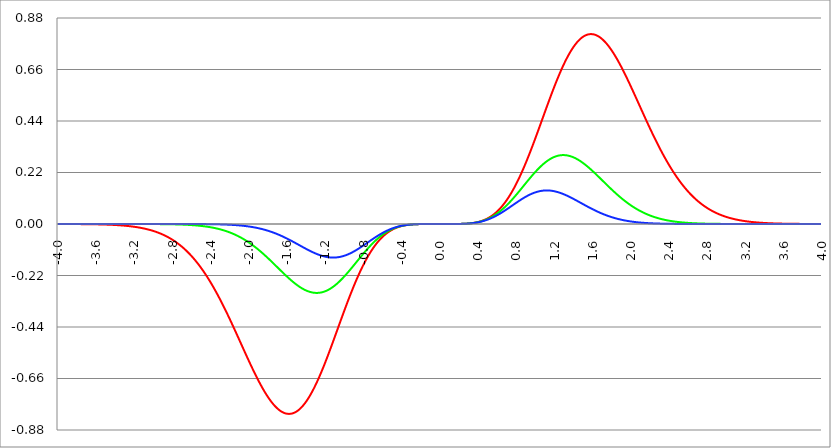
| Category | Series 1 | Series 0 | Series 2 |
|---|---|---|---|
| -4.0 | 0 | 0 | 0 |
| -3.996 | 0 | 0 | 0 |
| -3.992 | 0 | 0 | 0 |
| -3.988 | 0 | 0 | 0 |
| -3.984 | 0 | 0 | 0 |
| -3.98 | 0 | 0 | 0 |
| -3.976 | 0 | 0 | 0 |
| -3.972 | 0 | 0 | 0 |
| -3.968 | 0 | 0 | 0 |
| -3.964 | 0 | 0 | 0 |
| -3.96 | 0 | 0 | 0 |
| -3.956 | 0 | 0 | 0 |
| -3.952 | 0 | 0 | 0 |
| -3.948 | 0 | 0 | 0 |
| -3.944 | 0 | 0 | 0 |
| -3.94 | 0 | 0 | 0 |
| -3.936 | 0 | 0 | 0 |
| -3.932 | 0 | 0 | 0 |
| -3.928 | 0 | 0 | 0 |
| -3.924 | 0 | 0 | 0 |
| -3.92 | 0 | 0 | 0 |
| -3.916 | 0 | 0 | 0 |
| -3.912 | 0 | 0 | 0 |
| -3.908 | 0 | 0 | 0 |
| -3.904 | 0 | 0 | 0 |
| -3.9 | 0 | 0 | 0 |
| -3.896 | 0 | 0 | 0 |
| -3.892 | 0 | 0 | 0 |
| -3.888 | 0 | 0 | 0 |
| -3.884 | 0 | 0 | 0 |
| -3.88 | 0 | 0 | 0 |
| -3.876 | 0 | 0 | 0 |
| -3.872 | 0 | 0 | 0 |
| -3.868 | 0 | 0 | 0 |
| -3.864 | 0 | 0 | 0 |
| -3.86 | 0 | 0 | 0 |
| -3.856 | 0 | 0 | 0 |
| -3.852 | 0 | 0 | 0 |
| -3.848 | 0 | 0 | 0 |
| -3.844 | 0 | 0 | 0 |
| -3.84 | 0 | 0 | 0 |
| -3.836 | 0 | 0 | 0 |
| -3.832 | 0 | 0 | 0 |
| -3.828 | 0 | 0 | 0 |
| -3.824 | 0 | 0 | 0 |
| -3.82 | 0 | 0 | 0 |
| -3.816 | 0 | 0 | 0 |
| -3.812 | 0 | 0 | 0 |
| -3.808 | 0 | 0 | 0 |
| -3.804 | 0 | 0 | 0 |
| -3.8 | 0 | 0 | 0 |
| -3.796 | 0 | 0 | 0 |
| -3.792 | 0 | 0 | 0 |
| -3.788 | 0 | 0 | 0 |
| -3.784 | 0 | 0 | 0 |
| -3.78 | 0 | 0 | 0 |
| -3.776 | 0 | 0 | 0 |
| -3.772 | -0.001 | 0 | 0 |
| -3.768 | -0.001 | 0 | 0 |
| -3.764 | -0.001 | 0 | 0 |
| -3.76 | -0.001 | 0 | 0 |
| -3.756 | -0.001 | 0 | 0 |
| -3.752 | -0.001 | 0 | 0 |
| -3.748 | -0.001 | 0 | 0 |
| -3.744 | -0.001 | 0 | 0 |
| -3.74 | -0.001 | 0 | 0 |
| -3.736 | -0.001 | 0 | 0 |
| -3.732 | -0.001 | 0 | 0 |
| -3.728 | -0.001 | 0 | 0 |
| -3.724 | -0.001 | 0 | 0 |
| -3.72 | -0.001 | 0 | 0 |
| -3.716 | -0.001 | 0 | 0 |
| -3.712 | -0.001 | 0 | 0 |
| -3.708 | -0.001 | 0 | 0 |
| -3.704 | -0.001 | 0 | 0 |
| -3.7 | -0.001 | 0 | 0 |
| -3.696 | -0.001 | 0 | 0 |
| -3.692 | -0.001 | 0 | 0 |
| -3.688 | -0.001 | 0 | 0 |
| -3.684 | -0.001 | 0 | 0 |
| -3.68 | -0.001 | 0 | 0 |
| -3.676 | -0.001 | 0 | 0 |
| -3.672 | -0.001 | 0 | 0 |
| -3.668 | -0.001 | 0 | 0 |
| -3.664 | -0.001 | 0 | 0 |
| -3.66 | -0.001 | 0 | 0 |
| -3.656 | -0.001 | 0 | 0 |
| -3.652 | -0.001 | 0 | 0 |
| -3.648 | -0.001 | 0 | 0 |
| -3.644 | -0.001 | 0 | 0 |
| -3.64 | -0.001 | 0 | 0 |
| -3.636 | -0.001 | 0 | 0 |
| -3.632 | -0.001 | 0 | 0 |
| -3.628 | -0.001 | 0 | 0 |
| -3.624 | -0.001 | 0 | 0 |
| -3.62 | -0.001 | 0 | 0 |
| -3.616 | -0.001 | 0 | 0 |
| -3.612 | -0.001 | 0 | 0 |
| -3.608 | -0.001 | 0 | 0 |
| -3.604 | -0.001 | 0 | 0 |
| -3.6 | -0.001 | 0 | 0 |
| -3.596 | -0.001 | 0 | 0 |
| -3.592 | -0.001 | 0 | 0 |
| -3.588 | -0.002 | 0 | 0 |
| -3.584 | -0.002 | 0 | 0 |
| -3.58 | -0.002 | 0 | 0 |
| -3.576 | -0.002 | 0 | 0 |
| -3.572 | -0.002 | 0 | 0 |
| -3.568 | -0.002 | 0 | 0 |
| -3.564 | -0.002 | 0 | 0 |
| -3.56 | -0.002 | 0 | 0 |
| -3.556 | -0.002 | 0 | 0 |
| -3.552 | -0.002 | 0 | 0 |
| -3.548 | -0.002 | 0 | 0 |
| -3.544 | -0.002 | 0 | 0 |
| -3.54 | -0.002 | 0 | 0 |
| -3.536 | -0.002 | 0 | 0 |
| -3.532 | -0.002 | 0 | 0 |
| -3.528 | -0.002 | 0 | 0 |
| -3.524 | -0.002 | 0 | 0 |
| -3.52 | -0.002 | 0 | 0 |
| -3.516 | -0.002 | 0 | 0 |
| -3.512 | -0.002 | 0 | 0 |
| -3.508 | -0.002 | 0 | 0 |
| -3.504 | -0.002 | 0 | 0 |
| -3.5 | -0.003 | 0 | 0 |
| -3.496 | -0.003 | 0 | 0 |
| -3.492 | -0.003 | 0 | 0 |
| -3.488 | -0.003 | 0 | 0 |
| -3.484 | -0.003 | 0 | 0 |
| -3.48 | -0.003 | 0 | 0 |
| -3.476 | -0.003 | 0 | 0 |
| -3.472 | -0.003 | 0 | 0 |
| -3.467999999999999 | -0.003 | 0 | 0 |
| -3.463999999999999 | -0.003 | 0 | 0 |
| -3.459999999999999 | -0.003 | 0 | 0 |
| -3.455999999999999 | -0.003 | 0 | 0 |
| -3.451999999999999 | -0.003 | 0 | 0 |
| -3.447999999999999 | -0.003 | 0 | 0 |
| -3.443999999999999 | -0.003 | 0 | 0 |
| -3.439999999999999 | -0.003 | 0 | 0 |
| -3.435999999999999 | -0.004 | 0 | 0 |
| -3.431999999999999 | -0.004 | 0 | 0 |
| -3.427999999999999 | -0.004 | 0 | 0 |
| -3.423999999999999 | -0.004 | 0 | 0 |
| -3.419999999999999 | -0.004 | 0 | 0 |
| -3.415999999999999 | -0.004 | 0 | 0 |
| -3.411999999999999 | -0.004 | 0 | 0 |
| -3.407999999999999 | -0.004 | 0 | 0 |
| -3.403999999999999 | -0.004 | 0 | 0 |
| -3.399999999999999 | -0.004 | 0 | 0 |
| -3.395999999999999 | -0.004 | 0 | 0 |
| -3.391999999999999 | -0.005 | 0 | 0 |
| -3.387999999999999 | -0.005 | 0 | 0 |
| -3.383999999999999 | -0.005 | 0 | 0 |
| -3.379999999999999 | -0.005 | 0 | 0 |
| -3.375999999999999 | -0.005 | 0 | 0 |
| -3.371999999999999 | -0.005 | 0 | 0 |
| -3.367999999999999 | -0.005 | 0 | 0 |
| -3.363999999999999 | -0.005 | 0 | 0 |
| -3.359999999999999 | -0.005 | 0 | 0 |
| -3.355999999999999 | -0.005 | 0 | 0 |
| -3.351999999999999 | -0.006 | 0 | 0 |
| -3.347999999999999 | -0.006 | 0 | 0 |
| -3.343999999999999 | -0.006 | 0 | 0 |
| -3.339999999999999 | -0.006 | 0 | 0 |
| -3.335999999999999 | -0.006 | 0 | 0 |
| -3.331999999999999 | -0.006 | 0 | 0 |
| -3.327999999999999 | -0.006 | 0 | 0 |
| -3.323999999999999 | -0.006 | 0 | 0 |
| -3.319999999999999 | -0.007 | 0 | 0 |
| -3.315999999999999 | -0.007 | 0 | 0 |
| -3.311999999999999 | -0.007 | 0 | 0 |
| -3.307999999999999 | -0.007 | 0 | 0 |
| -3.303999999999999 | -0.007 | 0 | 0 |
| -3.299999999999999 | -0.007 | 0 | 0 |
| -3.295999999999999 | -0.007 | 0 | 0 |
| -3.291999999999999 | -0.008 | 0 | 0 |
| -3.288 | -0.008 | 0 | 0 |
| -3.284 | -0.008 | 0 | 0 |
| -3.279999999999999 | -0.008 | 0 | 0 |
| -3.275999999999999 | -0.008 | 0 | 0 |
| -3.271999999999999 | -0.008 | 0 | 0 |
| -3.268 | -0.009 | 0 | 0 |
| -3.264 | -0.009 | 0 | 0 |
| -3.259999999999999 | -0.009 | 0 | 0 |
| -3.255999999999999 | -0.009 | 0 | 0 |
| -3.251999999999999 | -0.009 | 0 | 0 |
| -3.248 | -0.009 | 0 | 0 |
| -3.244 | -0.01 | 0 | 0 |
| -3.239999999999999 | -0.01 | 0 | 0 |
| -3.235999999999999 | -0.01 | 0 | 0 |
| -3.231999999999999 | -0.01 | 0 | 0 |
| -3.228 | -0.01 | 0 | 0 |
| -3.224 | -0.011 | 0 | 0 |
| -3.219999999999999 | -0.011 | 0 | 0 |
| -3.215999999999999 | -0.011 | 0 | 0 |
| -3.211999999999999 | -0.011 | 0 | 0 |
| -3.208 | -0.012 | 0 | 0 |
| -3.204 | -0.012 | 0 | 0 |
| -3.199999999999999 | -0.012 | 0 | 0 |
| -3.195999999999999 | -0.012 | 0 | 0 |
| -3.191999999999999 | -0.012 | 0 | 0 |
| -3.188 | -0.013 | 0 | 0 |
| -3.184 | -0.013 | 0 | 0 |
| -3.179999999999999 | -0.013 | 0 | 0 |
| -3.175999999999999 | -0.013 | 0 | 0 |
| -3.171999999999999 | -0.014 | 0 | 0 |
| -3.168 | -0.014 | 0 | 0 |
| -3.164 | -0.014 | 0 | 0 |
| -3.159999999999999 | -0.015 | 0 | 0 |
| -3.155999999999999 | -0.015 | 0 | 0 |
| -3.151999999999999 | -0.015 | 0 | 0 |
| -3.148 | -0.015 | 0 | 0 |
| -3.144 | -0.016 | 0 | 0 |
| -3.139999999999999 | -0.016 | 0 | 0 |
| -3.135999999999999 | -0.016 | 0 | 0 |
| -3.131999999999999 | -0.017 | 0 | 0 |
| -3.128 | -0.017 | 0 | 0 |
| -3.124 | -0.017 | 0 | 0 |
| -3.119999999999999 | -0.018 | 0 | 0 |
| -3.115999999999999 | -0.018 | 0 | 0 |
| -3.111999999999999 | -0.018 | 0 | 0 |
| -3.108 | -0.019 | 0 | 0 |
| -3.104 | -0.019 | 0 | 0 |
| -3.099999999999999 | -0.019 | 0 | 0 |
| -3.095999999999999 | -0.02 | 0 | 0 |
| -3.091999999999999 | -0.02 | 0 | 0 |
| -3.088 | -0.02 | 0 | 0 |
| -3.084 | -0.021 | 0 | 0 |
| -3.079999999999999 | -0.021 | 0 | 0 |
| -3.075999999999999 | -0.021 | 0 | 0 |
| -3.071999999999999 | -0.022 | 0 | 0 |
| -3.068 | -0.022 | 0 | 0 |
| -3.064 | -0.023 | 0 | 0 |
| -3.059999999999999 | -0.023 | 0 | 0 |
| -3.055999999999999 | -0.023 | 0 | 0 |
| -3.051999999999999 | -0.024 | 0 | 0 |
| -3.048 | -0.024 | 0 | 0 |
| -3.044 | -0.025 | 0 | 0 |
| -3.039999999999999 | -0.025 | 0 | 0 |
| -3.035999999999999 | -0.026 | 0 | 0 |
| -3.031999999999999 | -0.026 | 0 | 0 |
| -3.028 | -0.027 | 0 | 0 |
| -3.024 | -0.027 | 0 | 0 |
| -3.019999999999999 | -0.027 | 0 | 0 |
| -3.015999999999999 | -0.028 | 0 | 0 |
| -3.011999999999999 | -0.028 | 0 | 0 |
| -3.008 | -0.029 | 0 | 0 |
| -3.004 | -0.029 | 0 | 0 |
| -2.999999999999999 | -0.03 | 0 | 0 |
| -2.995999999999999 | -0.031 | 0 | 0 |
| -2.991999999999999 | -0.031 | 0 | 0 |
| -2.988 | -0.032 | 0 | 0 |
| -2.984 | -0.032 | 0 | 0 |
| -2.979999999999999 | -0.033 | 0 | 0 |
| -2.975999999999999 | -0.033 | 0 | 0 |
| -2.971999999999999 | -0.034 | 0 | 0 |
| -2.968 | -0.034 | 0 | 0 |
| -2.964 | -0.035 | 0 | 0 |
| -2.959999999999999 | -0.036 | 0 | 0 |
| -2.955999999999999 | -0.036 | 0 | 0 |
| -2.951999999999999 | -0.037 | 0 | 0 |
| -2.948 | -0.037 | 0 | 0 |
| -2.944 | -0.038 | 0 | 0 |
| -2.939999999999999 | -0.039 | -0.001 | 0 |
| -2.935999999999999 | -0.039 | -0.001 | 0 |
| -2.931999999999999 | -0.04 | -0.001 | 0 |
| -2.928 | -0.041 | -0.001 | 0 |
| -2.924 | -0.041 | -0.001 | 0 |
| -2.919999999999999 | -0.042 | -0.001 | 0 |
| -2.915999999999999 | -0.043 | -0.001 | 0 |
| -2.911999999999999 | -0.043 | -0.001 | 0 |
| -2.908 | -0.044 | -0.001 | 0 |
| -2.904 | -0.045 | -0.001 | 0 |
| -2.899999999999999 | -0.046 | -0.001 | 0 |
| -2.895999999999999 | -0.046 | -0.001 | 0 |
| -2.891999999999999 | -0.047 | -0.001 | 0 |
| -2.887999999999999 | -0.048 | -0.001 | 0 |
| -2.883999999999999 | -0.049 | -0.001 | 0 |
| -2.879999999999999 | -0.05 | -0.001 | 0 |
| -2.875999999999999 | -0.05 | -0.001 | 0 |
| -2.871999999999999 | -0.051 | -0.001 | 0 |
| -2.867999999999999 | -0.052 | -0.001 | 0 |
| -2.863999999999999 | -0.053 | -0.001 | 0 |
| -2.859999999999999 | -0.054 | -0.001 | 0 |
| -2.855999999999999 | -0.054 | -0.001 | 0 |
| -2.851999999999999 | -0.055 | -0.001 | 0 |
| -2.847999999999999 | -0.056 | -0.001 | 0 |
| -2.843999999999999 | -0.057 | -0.001 | 0 |
| -2.839999999999999 | -0.058 | -0.001 | 0 |
| -2.835999999999999 | -0.059 | -0.001 | 0 |
| -2.831999999999999 | -0.06 | -0.001 | 0 |
| -2.827999999999999 | -0.061 | -0.001 | 0 |
| -2.823999999999999 | -0.062 | -0.001 | 0 |
| -2.819999999999999 | -0.063 | -0.001 | 0 |
| -2.815999999999999 | -0.064 | -0.001 | 0 |
| -2.811999999999999 | -0.065 | -0.001 | 0 |
| -2.807999999999999 | -0.066 | -0.001 | 0 |
| -2.803999999999999 | -0.067 | -0.001 | 0 |
| -2.799999999999999 | -0.068 | -0.001 | 0 |
| -2.795999999999999 | -0.069 | -0.001 | 0 |
| -2.791999999999999 | -0.07 | -0.001 | 0 |
| -2.787999999999999 | -0.071 | -0.001 | 0 |
| -2.783999999999999 | -0.072 | -0.001 | 0 |
| -2.779999999999999 | -0.073 | -0.002 | 0 |
| -2.775999999999999 | -0.074 | -0.002 | 0 |
| -2.771999999999999 | -0.075 | -0.002 | 0 |
| -2.767999999999999 | -0.076 | -0.002 | 0 |
| -2.763999999999999 | -0.078 | -0.002 | 0 |
| -2.759999999999999 | -0.079 | -0.002 | 0 |
| -2.755999999999999 | -0.08 | -0.002 | 0 |
| -2.751999999999999 | -0.081 | -0.002 | 0 |
| -2.747999999999999 | -0.082 | -0.002 | 0 |
| -2.743999999999999 | -0.084 | -0.002 | 0 |
| -2.739999999999999 | -0.085 | -0.002 | 0 |
| -2.735999999999999 | -0.086 | -0.002 | 0 |
| -2.731999999999999 | -0.087 | -0.002 | 0 |
| -2.727999999999999 | -0.089 | -0.002 | 0 |
| -2.723999999999999 | -0.09 | -0.002 | 0 |
| -2.719999999999999 | -0.091 | -0.002 | 0 |
| -2.715999999999999 | -0.092 | -0.002 | 0 |
| -2.711999999999999 | -0.094 | -0.002 | 0 |
| -2.707999999999999 | -0.095 | -0.002 | 0 |
| -2.703999999999999 | -0.097 | -0.002 | 0 |
| -2.699999999999999 | -0.098 | -0.003 | 0 |
| -2.695999999999999 | -0.099 | -0.003 | 0 |
| -2.691999999999999 | -0.101 | -0.003 | 0 |
| -2.687999999999999 | -0.102 | -0.003 | 0 |
| -2.683999999999999 | -0.104 | -0.003 | 0 |
| -2.679999999999999 | -0.105 | -0.003 | 0 |
| -2.675999999999999 | -0.107 | -0.003 | 0 |
| -2.671999999999999 | -0.108 | -0.003 | 0 |
| -2.667999999999999 | -0.11 | -0.003 | 0 |
| -2.663999999999999 | -0.111 | -0.003 | 0 |
| -2.659999999999999 | -0.113 | -0.003 | 0 |
| -2.655999999999999 | -0.114 | -0.003 | 0 |
| -2.651999999999999 | -0.116 | -0.003 | 0 |
| -2.647999999999999 | -0.117 | -0.004 | 0 |
| -2.643999999999999 | -0.119 | -0.004 | 0 |
| -2.639999999999999 | -0.121 | -0.004 | 0 |
| -2.635999999999999 | -0.122 | -0.004 | 0 |
| -2.631999999999999 | -0.124 | -0.004 | 0 |
| -2.627999999999999 | -0.126 | -0.004 | 0 |
| -2.623999999999999 | -0.127 | -0.004 | 0 |
| -2.619999999999999 | -0.129 | -0.004 | 0 |
| -2.615999999999999 | -0.131 | -0.004 | 0 |
| -2.611999999999999 | -0.132 | -0.004 | 0 |
| -2.607999999999999 | -0.134 | -0.004 | 0 |
| -2.603999999999999 | -0.136 | -0.005 | 0 |
| -2.599999999999999 | -0.138 | -0.005 | 0 |
| -2.595999999999999 | -0.14 | -0.005 | 0 |
| -2.591999999999999 | -0.141 | -0.005 | 0 |
| -2.587999999999999 | -0.143 | -0.005 | 0 |
| -2.583999999999999 | -0.145 | -0.005 | 0 |
| -2.579999999999999 | -0.147 | -0.005 | 0 |
| -2.575999999999999 | -0.149 | -0.005 | 0 |
| -2.571999999999999 | -0.151 | -0.006 | 0 |
| -2.567999999999999 | -0.153 | -0.006 | 0 |
| -2.563999999999999 | -0.155 | -0.006 | 0 |
| -2.559999999999999 | -0.157 | -0.006 | 0 |
| -2.555999999999999 | -0.159 | -0.006 | 0 |
| -2.551999999999999 | -0.161 | -0.006 | 0 |
| -2.547999999999999 | -0.163 | -0.006 | 0 |
| -2.543999999999999 | -0.165 | -0.006 | 0 |
| -2.539999999999999 | -0.167 | -0.007 | 0 |
| -2.535999999999999 | -0.169 | -0.007 | 0 |
| -2.531999999999999 | -0.171 | -0.007 | 0 |
| -2.527999999999999 | -0.173 | -0.007 | 0 |
| -2.523999999999999 | -0.175 | -0.007 | 0 |
| -2.519999999999999 | -0.177 | -0.007 | 0 |
| -2.515999999999999 | -0.18 | -0.008 | 0 |
| -2.511999999999999 | -0.182 | -0.008 | 0 |
| -2.507999999999999 | -0.184 | -0.008 | 0 |
| -2.503999999999999 | -0.186 | -0.008 | 0 |
| -2.499999999999999 | -0.189 | -0.008 | 0 |
| -2.495999999999999 | -0.191 | -0.008 | 0 |
| -2.491999999999999 | -0.193 | -0.009 | 0 |
| -2.487999999999999 | -0.195 | -0.009 | 0 |
| -2.483999999999999 | -0.198 | -0.009 | 0 |
| -2.479999999999999 | -0.2 | -0.009 | 0 |
| -2.475999999999999 | -0.202 | -0.009 | 0 |
| -2.471999999999999 | -0.205 | -0.01 | 0 |
| -2.467999999999999 | -0.207 | -0.01 | 0 |
| -2.463999999999999 | -0.21 | -0.01 | 0 |
| -2.459999999999999 | -0.212 | -0.01 | 0 |
| -2.455999999999999 | -0.215 | -0.011 | -0.001 |
| -2.451999999999999 | -0.217 | -0.011 | -0.001 |
| -2.447999999999999 | -0.22 | -0.011 | -0.001 |
| -2.443999999999999 | -0.222 | -0.011 | -0.001 |
| -2.439999999999999 | -0.225 | -0.011 | -0.001 |
| -2.435999999999999 | -0.227 | -0.012 | -0.001 |
| -2.431999999999999 | -0.23 | -0.012 | -0.001 |
| -2.427999999999999 | -0.232 | -0.012 | -0.001 |
| -2.423999999999999 | -0.235 | -0.012 | -0.001 |
| -2.419999999999999 | -0.238 | -0.013 | -0.001 |
| -2.415999999999999 | -0.24 | -0.013 | -0.001 |
| -2.411999999999999 | -0.243 | -0.013 | -0.001 |
| -2.407999999999999 | -0.245 | -0.014 | -0.001 |
| -2.403999999999999 | -0.248 | -0.014 | -0.001 |
| -2.399999999999999 | -0.251 | -0.014 | -0.001 |
| -2.395999999999999 | -0.254 | -0.014 | -0.001 |
| -2.391999999999999 | -0.256 | -0.015 | -0.001 |
| -2.387999999999999 | -0.259 | -0.015 | -0.001 |
| -2.383999999999999 | -0.262 | -0.015 | -0.001 |
| -2.379999999999999 | -0.265 | -0.016 | -0.001 |
| -2.375999999999999 | -0.268 | -0.016 | -0.001 |
| -2.371999999999999 | -0.27 | -0.016 | -0.001 |
| -2.367999999999998 | -0.273 | -0.017 | -0.001 |
| -2.363999999999998 | -0.276 | -0.017 | -0.001 |
| -2.359999999999998 | -0.279 | -0.017 | -0.001 |
| -2.355999999999998 | -0.282 | -0.018 | -0.001 |
| -2.351999999999998 | -0.285 | -0.018 | -0.001 |
| -2.347999999999998 | -0.288 | -0.018 | -0.001 |
| -2.343999999999998 | -0.291 | -0.019 | -0.001 |
| -2.339999999999998 | -0.294 | -0.019 | -0.001 |
| -2.335999999999998 | -0.297 | -0.019 | -0.001 |
| -2.331999999999998 | -0.3 | -0.02 | -0.001 |
| -2.327999999999998 | -0.303 | -0.02 | -0.001 |
| -2.323999999999998 | -0.306 | -0.021 | -0.001 |
| -2.319999999999998 | -0.309 | -0.021 | -0.001 |
| -2.315999999999998 | -0.312 | -0.021 | -0.001 |
| -2.311999999999998 | -0.315 | -0.022 | -0.002 |
| -2.307999999999998 | -0.318 | -0.022 | -0.002 |
| -2.303999999999998 | -0.321 | -0.023 | -0.002 |
| -2.299999999999998 | -0.325 | -0.023 | -0.002 |
| -2.295999999999998 | -0.328 | -0.023 | -0.002 |
| -2.291999999999998 | -0.331 | -0.024 | -0.002 |
| -2.287999999999998 | -0.334 | -0.024 | -0.002 |
| -2.283999999999998 | -0.337 | -0.025 | -0.002 |
| -2.279999999999998 | -0.34 | -0.025 | -0.002 |
| -2.275999999999998 | -0.344 | -0.026 | -0.002 |
| -2.271999999999998 | -0.347 | -0.026 | -0.002 |
| -2.267999999999998 | -0.35 | -0.027 | -0.002 |
| -2.263999999999998 | -0.353 | -0.027 | -0.002 |
| -2.259999999999998 | -0.357 | -0.028 | -0.002 |
| -2.255999999999998 | -0.36 | -0.028 | -0.002 |
| -2.251999999999998 | -0.363 | -0.029 | -0.002 |
| -2.247999999999998 | -0.367 | -0.029 | -0.002 |
| -2.243999999999998 | -0.37 | -0.03 | -0.002 |
| -2.239999999999998 | -0.373 | -0.03 | -0.002 |
| -2.235999999999998 | -0.377 | -0.031 | -0.003 |
| -2.231999999999998 | -0.38 | -0.031 | -0.003 |
| -2.227999999999998 | -0.383 | -0.032 | -0.003 |
| -2.223999999999998 | -0.387 | -0.033 | -0.003 |
| -2.219999999999998 | -0.39 | -0.033 | -0.003 |
| -2.215999999999998 | -0.394 | -0.034 | -0.003 |
| -2.211999999999998 | -0.397 | -0.034 | -0.003 |
| -2.207999999999998 | -0.401 | -0.035 | -0.003 |
| -2.203999999999998 | -0.404 | -0.036 | -0.003 |
| -2.199999999999998 | -0.408 | -0.036 | -0.003 |
| -2.195999999999998 | -0.411 | -0.037 | -0.003 |
| -2.191999999999998 | -0.414 | -0.038 | -0.003 |
| -2.187999999999998 | -0.418 | -0.038 | -0.003 |
| -2.183999999999998 | -0.421 | -0.039 | -0.004 |
| -2.179999999999998 | -0.425 | -0.039 | -0.004 |
| -2.175999999999998 | -0.428 | -0.04 | -0.004 |
| -2.171999999999998 | -0.432 | -0.041 | -0.004 |
| -2.167999999999998 | -0.436 | -0.042 | -0.004 |
| -2.163999999999998 | -0.439 | -0.042 | -0.004 |
| -2.159999999999998 | -0.443 | -0.043 | -0.004 |
| -2.155999999999998 | -0.446 | -0.044 | -0.004 |
| -2.151999999999998 | -0.45 | -0.044 | -0.004 |
| -2.147999999999998 | -0.453 | -0.045 | -0.004 |
| -2.143999999999998 | -0.457 | -0.046 | -0.005 |
| -2.139999999999998 | -0.46 | -0.047 | -0.005 |
| -2.135999999999998 | -0.464 | -0.047 | -0.005 |
| -2.131999999999998 | -0.468 | -0.048 | -0.005 |
| -2.127999999999998 | -0.471 | -0.049 | -0.005 |
| -2.123999999999998 | -0.475 | -0.05 | -0.005 |
| -2.119999999999998 | -0.478 | -0.051 | -0.005 |
| -2.115999999999998 | -0.482 | -0.051 | -0.005 |
| -2.111999999999998 | -0.486 | -0.052 | -0.006 |
| -2.107999999999998 | -0.489 | -0.053 | -0.006 |
| -2.103999999999998 | -0.493 | -0.054 | -0.006 |
| -2.099999999999998 | -0.496 | -0.055 | -0.006 |
| -2.095999999999998 | -0.5 | -0.056 | -0.006 |
| -2.091999999999998 | -0.504 | -0.056 | -0.006 |
| -2.087999999999998 | -0.507 | -0.057 | -0.006 |
| -2.083999999999998 | -0.511 | -0.058 | -0.007 |
| -2.079999999999998 | -0.514 | -0.059 | -0.007 |
| -2.075999999999998 | -0.518 | -0.06 | -0.007 |
| -2.071999999999998 | -0.522 | -0.061 | -0.007 |
| -2.067999999999998 | -0.525 | -0.062 | -0.007 |
| -2.063999999999998 | -0.529 | -0.063 | -0.007 |
| -2.059999999999998 | -0.533 | -0.064 | -0.008 |
| -2.055999999999998 | -0.536 | -0.065 | -0.008 |
| -2.051999999999998 | -0.54 | -0.066 | -0.008 |
| -2.047999999999998 | -0.543 | -0.067 | -0.008 |
| -2.043999999999998 | -0.547 | -0.068 | -0.008 |
| -2.039999999999998 | -0.551 | -0.069 | -0.009 |
| -2.035999999999998 | -0.554 | -0.07 | -0.009 |
| -2.031999999999998 | -0.558 | -0.071 | -0.009 |
| -2.027999999999998 | -0.561 | -0.072 | -0.009 |
| -2.023999999999998 | -0.565 | -0.073 | -0.009 |
| -2.019999999999998 | -0.568 | -0.074 | -0.01 |
| -2.015999999999998 | -0.572 | -0.075 | -0.01 |
| -2.011999999999998 | -0.576 | -0.076 | -0.01 |
| -2.007999999999998 | -0.579 | -0.077 | -0.01 |
| -2.003999999999998 | -0.583 | -0.078 | -0.011 |
| -1.999999999999998 | -0.586 | -0.079 | -0.011 |
| -1.995999999999998 | -0.59 | -0.08 | -0.011 |
| -1.991999999999998 | -0.593 | -0.082 | -0.011 |
| -1.987999999999998 | -0.597 | -0.083 | -0.011 |
| -1.983999999999998 | -0.6 | -0.084 | -0.012 |
| -1.979999999999998 | -0.604 | -0.085 | -0.012 |
| -1.975999999999998 | -0.607 | -0.086 | -0.012 |
| -1.971999999999998 | -0.61 | -0.087 | -0.012 |
| -1.967999999999998 | -0.614 | -0.089 | -0.013 |
| -1.963999999999998 | -0.617 | -0.09 | -0.013 |
| -1.959999999999998 | -0.621 | -0.091 | -0.013 |
| -1.955999999999998 | -0.624 | -0.092 | -0.014 |
| -1.951999999999998 | -0.627 | -0.093 | -0.014 |
| -1.947999999999998 | -0.631 | -0.095 | -0.014 |
| -1.943999999999998 | -0.634 | -0.096 | -0.014 |
| -1.939999999999998 | -0.638 | -0.097 | -0.015 |
| -1.935999999999998 | -0.641 | -0.098 | -0.015 |
| -1.931999999999998 | -0.644 | -0.1 | -0.015 |
| -1.927999999999998 | -0.647 | -0.101 | -0.016 |
| -1.923999999999998 | -0.651 | -0.102 | -0.016 |
| -1.919999999999998 | -0.654 | -0.104 | -0.016 |
| -1.915999999999998 | -0.657 | -0.105 | -0.017 |
| -1.911999999999998 | -0.66 | -0.106 | -0.017 |
| -1.907999999999998 | -0.664 | -0.107 | -0.017 |
| -1.903999999999998 | -0.667 | -0.109 | -0.018 |
| -1.899999999999998 | -0.67 | -0.11 | -0.018 |
| -1.895999999999998 | -0.673 | -0.112 | -0.018 |
| -1.891999999999998 | -0.676 | -0.113 | -0.019 |
| -1.887999999999998 | -0.679 | -0.114 | -0.019 |
| -1.883999999999998 | -0.682 | -0.116 | -0.02 |
| -1.879999999999998 | -0.685 | -0.117 | -0.02 |
| -1.875999999999998 | -0.688 | -0.118 | -0.02 |
| -1.871999999999998 | -0.691 | -0.12 | -0.021 |
| -1.867999999999998 | -0.694 | -0.121 | -0.021 |
| -1.863999999999998 | -0.697 | -0.123 | -0.022 |
| -1.859999999999998 | -0.7 | -0.124 | -0.022 |
| -1.855999999999998 | -0.703 | -0.126 | -0.022 |
| -1.851999999999998 | -0.706 | -0.127 | -0.023 |
| -1.847999999999998 | -0.709 | -0.128 | -0.023 |
| -1.843999999999998 | -0.711 | -0.13 | -0.024 |
| -1.839999999999998 | -0.714 | -0.131 | -0.024 |
| -1.835999999999998 | -0.717 | -0.133 | -0.025 |
| -1.831999999999998 | -0.72 | -0.134 | -0.025 |
| -1.827999999999998 | -0.722 | -0.136 | -0.026 |
| -1.823999999999998 | -0.725 | -0.137 | -0.026 |
| -1.819999999999998 | -0.727 | -0.139 | -0.026 |
| -1.815999999999998 | -0.73 | -0.14 | -0.027 |
| -1.811999999999998 | -0.733 | -0.142 | -0.027 |
| -1.807999999999998 | -0.735 | -0.143 | -0.028 |
| -1.803999999999998 | -0.738 | -0.145 | -0.028 |
| -1.799999999999998 | -0.74 | -0.146 | -0.029 |
| -1.795999999999998 | -0.742 | -0.148 | -0.029 |
| -1.791999999999998 | -0.745 | -0.15 | -0.03 |
| -1.787999999999998 | -0.747 | -0.151 | -0.031 |
| -1.783999999999998 | -0.749 | -0.153 | -0.031 |
| -1.779999999999998 | -0.752 | -0.154 | -0.032 |
| -1.775999999999998 | -0.754 | -0.156 | -0.032 |
| -1.771999999999998 | -0.756 | -0.157 | -0.033 |
| -1.767999999999998 | -0.758 | -0.159 | -0.033 |
| -1.763999999999998 | -0.761 | -0.16 | -0.034 |
| -1.759999999999998 | -0.763 | -0.162 | -0.034 |
| -1.755999999999998 | -0.765 | -0.164 | -0.035 |
| -1.751999999999998 | -0.767 | -0.165 | -0.036 |
| -1.747999999999998 | -0.769 | -0.167 | -0.036 |
| -1.743999999999998 | -0.771 | -0.168 | -0.037 |
| -1.739999999999998 | -0.772 | -0.17 | -0.037 |
| -1.735999999999998 | -0.774 | -0.172 | -0.038 |
| -1.731999999999998 | -0.776 | -0.173 | -0.039 |
| -1.727999999999998 | -0.778 | -0.175 | -0.039 |
| -1.723999999999998 | -0.78 | -0.176 | -0.04 |
| -1.719999999999998 | -0.781 | -0.178 | -0.041 |
| -1.715999999999998 | -0.783 | -0.18 | -0.041 |
| -1.711999999999998 | -0.785 | -0.181 | -0.042 |
| -1.707999999999998 | -0.786 | -0.183 | -0.043 |
| -1.703999999999998 | -0.788 | -0.184 | -0.043 |
| -1.699999999999998 | -0.789 | -0.186 | -0.044 |
| -1.695999999999998 | -0.791 | -0.188 | -0.045 |
| -1.691999999999998 | -0.792 | -0.189 | -0.045 |
| -1.687999999999998 | -0.793 | -0.191 | -0.046 |
| -1.683999999999998 | -0.795 | -0.192 | -0.047 |
| -1.679999999999998 | -0.796 | -0.194 | -0.047 |
| -1.675999999999998 | -0.797 | -0.196 | -0.048 |
| -1.671999999999998 | -0.798 | -0.197 | -0.049 |
| -1.667999999999998 | -0.799 | -0.199 | -0.049 |
| -1.663999999999998 | -0.8 | -0.2 | -0.05 |
| -1.659999999999998 | -0.801 | -0.202 | -0.051 |
| -1.655999999999998 | -0.802 | -0.204 | -0.052 |
| -1.651999999999998 | -0.803 | -0.205 | -0.052 |
| -1.647999999999998 | -0.804 | -0.207 | -0.053 |
| -1.643999999999998 | -0.805 | -0.208 | -0.054 |
| -1.639999999999998 | -0.806 | -0.21 | -0.055 |
| -1.635999999999998 | -0.806 | -0.212 | -0.055 |
| -1.631999999999998 | -0.807 | -0.213 | -0.056 |
| -1.627999999999998 | -0.808 | -0.215 | -0.057 |
| -1.623999999999998 | -0.808 | -0.216 | -0.058 |
| -1.619999999999998 | -0.809 | -0.218 | -0.059 |
| -1.615999999999998 | -0.809 | -0.219 | -0.059 |
| -1.611999999999998 | -0.81 | -0.221 | -0.06 |
| -1.607999999999998 | -0.81 | -0.222 | -0.061 |
| -1.603999999999998 | -0.81 | -0.224 | -0.062 |
| -1.599999999999998 | -0.811 | -0.225 | -0.063 |
| -1.595999999999998 | -0.811 | -0.227 | -0.063 |
| -1.591999999999998 | -0.811 | -0.228 | -0.064 |
| -1.587999999999998 | -0.811 | -0.23 | -0.065 |
| -1.583999999999998 | -0.811 | -0.231 | -0.066 |
| -1.579999999999998 | -0.811 | -0.233 | -0.067 |
| -1.575999999999998 | -0.811 | -0.234 | -0.068 |
| -1.571999999999998 | -0.811 | -0.236 | -0.069 |
| -1.567999999999998 | -0.811 | -0.237 | -0.069 |
| -1.563999999999998 | -0.811 | -0.239 | -0.07 |
| -1.559999999999998 | -0.81 | -0.24 | -0.071 |
| -1.555999999999998 | -0.81 | -0.241 | -0.072 |
| -1.551999999999998 | -0.81 | -0.243 | -0.073 |
| -1.547999999999998 | -0.809 | -0.244 | -0.074 |
| -1.543999999999998 | -0.809 | -0.246 | -0.075 |
| -1.539999999999998 | -0.808 | -0.247 | -0.075 |
| -1.535999999999998 | -0.808 | -0.248 | -0.076 |
| -1.531999999999998 | -0.807 | -0.25 | -0.077 |
| -1.527999999999998 | -0.807 | -0.251 | -0.078 |
| -1.523999999999998 | -0.806 | -0.252 | -0.079 |
| -1.519999999999998 | -0.805 | -0.254 | -0.08 |
| -1.515999999999998 | -0.804 | -0.255 | -0.081 |
| -1.511999999999998 | -0.803 | -0.256 | -0.082 |
| -1.507999999999998 | -0.802 | -0.257 | -0.083 |
| -1.503999999999998 | -0.801 | -0.259 | -0.083 |
| -1.499999999999998 | -0.8 | -0.26 | -0.084 |
| -1.495999999999998 | -0.799 | -0.261 | -0.085 |
| -1.491999999999998 | -0.798 | -0.262 | -0.086 |
| -1.487999999999998 | -0.797 | -0.263 | -0.087 |
| -1.483999999999998 | -0.796 | -0.265 | -0.088 |
| -1.479999999999998 | -0.794 | -0.266 | -0.089 |
| -1.475999999999998 | -0.793 | -0.267 | -0.09 |
| -1.471999999999998 | -0.792 | -0.268 | -0.091 |
| -1.467999999999998 | -0.79 | -0.269 | -0.092 |
| -1.463999999999998 | -0.789 | -0.27 | -0.092 |
| -1.459999999999998 | -0.787 | -0.271 | -0.093 |
| -1.455999999999998 | -0.785 | -0.272 | -0.094 |
| -1.451999999999998 | -0.784 | -0.273 | -0.095 |
| -1.447999999999998 | -0.782 | -0.274 | -0.096 |
| -1.443999999999998 | -0.78 | -0.275 | -0.097 |
| -1.439999999999998 | -0.779 | -0.276 | -0.098 |
| -1.435999999999998 | -0.777 | -0.277 | -0.099 |
| -1.431999999999998 | -0.775 | -0.278 | -0.1 |
| -1.427999999999998 | -0.773 | -0.279 | -0.101 |
| -1.423999999999998 | -0.771 | -0.28 | -0.101 |
| -1.419999999999998 | -0.769 | -0.28 | -0.102 |
| -1.415999999999998 | -0.767 | -0.281 | -0.103 |
| -1.411999999999998 | -0.764 | -0.282 | -0.104 |
| -1.407999999999998 | -0.762 | -0.283 | -0.105 |
| -1.403999999999998 | -0.76 | -0.284 | -0.106 |
| -1.399999999999998 | -0.758 | -0.284 | -0.107 |
| -1.395999999999998 | -0.755 | -0.285 | -0.108 |
| -1.391999999999998 | -0.753 | -0.286 | -0.108 |
| -1.387999999999998 | -0.75 | -0.286 | -0.109 |
| -1.383999999999998 | -0.748 | -0.287 | -0.11 |
| -1.379999999999998 | -0.745 | -0.288 | -0.111 |
| -1.375999999999998 | -0.743 | -0.288 | -0.112 |
| -1.371999999999998 | -0.74 | -0.289 | -0.113 |
| -1.367999999999998 | -0.737 | -0.289 | -0.113 |
| -1.363999999999998 | -0.735 | -0.29 | -0.114 |
| -1.359999999999998 | -0.732 | -0.29 | -0.115 |
| -1.355999999999998 | -0.729 | -0.291 | -0.116 |
| -1.351999999999998 | -0.726 | -0.291 | -0.117 |
| -1.347999999999998 | -0.723 | -0.292 | -0.118 |
| -1.343999999999998 | -0.72 | -0.292 | -0.118 |
| -1.339999999999998 | -0.717 | -0.292 | -0.119 |
| -1.335999999999998 | -0.714 | -0.293 | -0.12 |
| -1.331999999999998 | -0.711 | -0.293 | -0.121 |
| -1.327999999999998 | -0.708 | -0.293 | -0.121 |
| -1.323999999999998 | -0.705 | -0.293 | -0.122 |
| -1.319999999999998 | -0.702 | -0.294 | -0.123 |
| -1.315999999999998 | -0.698 | -0.294 | -0.124 |
| -1.311999999999998 | -0.695 | -0.294 | -0.124 |
| -1.307999999999998 | -0.692 | -0.294 | -0.125 |
| -1.303999999999998 | -0.689 | -0.294 | -0.126 |
| -1.299999999999998 | -0.685 | -0.294 | -0.126 |
| -1.295999999999998 | -0.682 | -0.294 | -0.127 |
| -1.291999999999998 | -0.678 | -0.294 | -0.128 |
| -1.287999999999998 | -0.675 | -0.294 | -0.128 |
| -1.283999999999998 | -0.671 | -0.294 | -0.129 |
| -1.279999999999998 | -0.668 | -0.294 | -0.13 |
| -1.275999999999998 | -0.664 | -0.294 | -0.13 |
| -1.271999999999998 | -0.66 | -0.294 | -0.131 |
| -1.267999999999998 | -0.657 | -0.294 | -0.132 |
| -1.263999999999998 | -0.653 | -0.294 | -0.132 |
| -1.259999999999998 | -0.649 | -0.294 | -0.133 |
| -1.255999999999998 | -0.645 | -0.293 | -0.133 |
| -1.251999999999998 | -0.642 | -0.293 | -0.134 |
| -1.247999999999998 | -0.638 | -0.293 | -0.134 |
| -1.243999999999998 | -0.634 | -0.292 | -0.135 |
| -1.239999999999998 | -0.63 | -0.292 | -0.135 |
| -1.235999999999998 | -0.626 | -0.292 | -0.136 |
| -1.231999999999998 | -0.622 | -0.291 | -0.136 |
| -1.227999999999998 | -0.618 | -0.291 | -0.137 |
| -1.223999999999998 | -0.614 | -0.29 | -0.137 |
| -1.219999999999998 | -0.61 | -0.29 | -0.138 |
| -1.215999999999998 | -0.606 | -0.289 | -0.138 |
| -1.211999999999998 | -0.602 | -0.289 | -0.139 |
| -1.207999999999998 | -0.598 | -0.288 | -0.139 |
| -1.203999999999998 | -0.594 | -0.288 | -0.139 |
| -1.199999999999997 | -0.59 | -0.287 | -0.14 |
| -1.195999999999997 | -0.585 | -0.286 | -0.14 |
| -1.191999999999997 | -0.581 | -0.286 | -0.14 |
| -1.187999999999997 | -0.577 | -0.285 | -0.141 |
| -1.183999999999997 | -0.573 | -0.284 | -0.141 |
| -1.179999999999997 | -0.568 | -0.283 | -0.141 |
| -1.175999999999997 | -0.564 | -0.283 | -0.142 |
| -1.171999999999997 | -0.56 | -0.282 | -0.142 |
| -1.167999999999997 | -0.556 | -0.281 | -0.142 |
| -1.163999999999997 | -0.551 | -0.28 | -0.142 |
| -1.159999999999997 | -0.547 | -0.279 | -0.142 |
| -1.155999999999997 | -0.543 | -0.278 | -0.143 |
| -1.151999999999997 | -0.538 | -0.277 | -0.143 |
| -1.147999999999997 | -0.534 | -0.276 | -0.143 |
| -1.143999999999997 | -0.529 | -0.275 | -0.143 |
| -1.139999999999997 | -0.525 | -0.274 | -0.143 |
| -1.135999999999997 | -0.521 | -0.273 | -0.143 |
| -1.131999999999997 | -0.516 | -0.272 | -0.143 |
| -1.127999999999997 | -0.512 | -0.271 | -0.143 |
| -1.123999999999997 | -0.507 | -0.27 | -0.143 |
| -1.119999999999997 | -0.503 | -0.268 | -0.143 |
| -1.115999999999997 | -0.498 | -0.267 | -0.143 |
| -1.111999999999997 | -0.494 | -0.266 | -0.143 |
| -1.107999999999997 | -0.489 | -0.265 | -0.143 |
| -1.103999999999997 | -0.485 | -0.264 | -0.143 |
| -1.099999999999997 | -0.48 | -0.262 | -0.143 |
| -1.095999999999997 | -0.476 | -0.261 | -0.143 |
| -1.091999999999997 | -0.471 | -0.26 | -0.143 |
| -1.087999999999997 | -0.467 | -0.258 | -0.143 |
| -1.083999999999997 | -0.462 | -0.257 | -0.143 |
| -1.079999999999997 | -0.458 | -0.255 | -0.143 |
| -1.075999999999997 | -0.453 | -0.254 | -0.142 |
| -1.071999999999997 | -0.449 | -0.253 | -0.142 |
| -1.067999999999997 | -0.444 | -0.251 | -0.142 |
| -1.063999999999997 | -0.44 | -0.25 | -0.142 |
| -1.059999999999997 | -0.435 | -0.248 | -0.141 |
| -1.055999999999997 | -0.431 | -0.247 | -0.141 |
| -1.051999999999997 | -0.426 | -0.245 | -0.141 |
| -1.047999999999997 | -0.422 | -0.243 | -0.141 |
| -1.043999999999997 | -0.417 | -0.242 | -0.14 |
| -1.039999999999997 | -0.413 | -0.24 | -0.14 |
| -1.035999999999997 | -0.408 | -0.239 | -0.139 |
| -1.031999999999997 | -0.404 | -0.237 | -0.139 |
| -1.027999999999997 | -0.399 | -0.235 | -0.139 |
| -1.023999999999997 | -0.395 | -0.234 | -0.138 |
| -1.019999999999997 | -0.39 | -0.232 | -0.138 |
| -1.015999999999997 | -0.386 | -0.23 | -0.137 |
| -1.011999999999997 | -0.381 | -0.228 | -0.137 |
| -1.007999999999997 | -0.377 | -0.227 | -0.136 |
| -1.003999999999997 | -0.372 | -0.225 | -0.136 |
| -0.999999999999997 | -0.368 | -0.223 | -0.135 |
| -0.995999999999997 | -0.363 | -0.221 | -0.135 |
| -0.991999999999997 | -0.359 | -0.22 | -0.134 |
| -0.987999999999997 | -0.355 | -0.218 | -0.134 |
| -0.983999999999997 | -0.35 | -0.216 | -0.133 |
| -0.979999999999997 | -0.346 | -0.214 | -0.132 |
| -0.975999999999997 | -0.342 | -0.212 | -0.132 |
| -0.971999999999997 | -0.337 | -0.21 | -0.131 |
| -0.967999999999997 | -0.333 | -0.208 | -0.13 |
| -0.963999999999997 | -0.329 | -0.207 | -0.13 |
| -0.959999999999997 | -0.324 | -0.205 | -0.129 |
| -0.955999999999997 | -0.32 | -0.203 | -0.128 |
| -0.951999999999997 | -0.316 | -0.201 | -0.128 |
| -0.947999999999997 | -0.312 | -0.199 | -0.127 |
| -0.943999999999997 | -0.307 | -0.197 | -0.126 |
| -0.939999999999997 | -0.303 | -0.195 | -0.125 |
| -0.935999999999997 | -0.299 | -0.193 | -0.125 |
| -0.931999999999997 | -0.295 | -0.191 | -0.124 |
| -0.927999999999997 | -0.291 | -0.189 | -0.123 |
| -0.923999999999997 | -0.287 | -0.187 | -0.122 |
| -0.919999999999997 | -0.283 | -0.185 | -0.121 |
| -0.915999999999997 | -0.279 | -0.183 | -0.12 |
| -0.911999999999997 | -0.275 | -0.181 | -0.12 |
| -0.907999999999997 | -0.271 | -0.179 | -0.119 |
| -0.903999999999997 | -0.267 | -0.177 | -0.118 |
| -0.899999999999997 | -0.263 | -0.175 | -0.117 |
| -0.895999999999997 | -0.259 | -0.173 | -0.116 |
| -0.891999999999997 | -0.255 | -0.171 | -0.115 |
| -0.887999999999997 | -0.251 | -0.169 | -0.114 |
| -0.883999999999997 | -0.247 | -0.167 | -0.113 |
| -0.879999999999997 | -0.243 | -0.165 | -0.112 |
| -0.875999999999997 | -0.239 | -0.163 | -0.111 |
| -0.871999999999997 | -0.236 | -0.161 | -0.11 |
| -0.867999999999997 | -0.232 | -0.159 | -0.109 |
| -0.863999999999997 | -0.228 | -0.157 | -0.108 |
| -0.859999999999997 | -0.225 | -0.155 | -0.107 |
| -0.855999999999997 | -0.221 | -0.153 | -0.106 |
| -0.851999999999997 | -0.217 | -0.151 | -0.105 |
| -0.847999999999997 | -0.214 | -0.149 | -0.104 |
| -0.843999999999997 | -0.21 | -0.147 | -0.103 |
| -0.839999999999997 | -0.207 | -0.145 | -0.102 |
| -0.835999999999997 | -0.203 | -0.143 | -0.101 |
| -0.831999999999997 | -0.2 | -0.141 | -0.1 |
| -0.827999999999997 | -0.196 | -0.139 | -0.099 |
| -0.823999999999997 | -0.193 | -0.137 | -0.098 |
| -0.819999999999997 | -0.189 | -0.135 | -0.097 |
| -0.815999999999997 | -0.186 | -0.133 | -0.096 |
| -0.811999999999997 | -0.183 | -0.131 | -0.094 |
| -0.807999999999997 | -0.179 | -0.129 | -0.093 |
| -0.803999999999997 | -0.176 | -0.127 | -0.092 |
| -0.799999999999997 | -0.173 | -0.125 | -0.091 |
| -0.795999999999997 | -0.17 | -0.124 | -0.09 |
| -0.791999999999997 | -0.166 | -0.122 | -0.089 |
| -0.787999999999997 | -0.163 | -0.12 | -0.088 |
| -0.783999999999997 | -0.16 | -0.118 | -0.087 |
| -0.779999999999997 | -0.157 | -0.116 | -0.086 |
| -0.775999999999997 | -0.154 | -0.114 | -0.084 |
| -0.771999999999997 | -0.151 | -0.112 | -0.083 |
| -0.767999999999997 | -0.148 | -0.11 | -0.082 |
| -0.763999999999997 | -0.145 | -0.108 | -0.081 |
| -0.759999999999997 | -0.142 | -0.107 | -0.08 |
| -0.755999999999997 | -0.139 | -0.105 | -0.079 |
| -0.751999999999997 | -0.137 | -0.103 | -0.078 |
| -0.747999999999997 | -0.134 | -0.101 | -0.076 |
| -0.743999999999997 | -0.131 | -0.099 | -0.075 |
| -0.739999999999997 | -0.128 | -0.098 | -0.074 |
| -0.735999999999997 | -0.126 | -0.096 | -0.073 |
| -0.731999999999997 | -0.123 | -0.094 | -0.072 |
| -0.727999999999997 | -0.12 | -0.092 | -0.071 |
| -0.723999999999997 | -0.118 | -0.091 | -0.07 |
| -0.719999999999997 | -0.115 | -0.089 | -0.069 |
| -0.715999999999997 | -0.113 | -0.087 | -0.067 |
| -0.711999999999997 | -0.11 | -0.086 | -0.066 |
| -0.707999999999997 | -0.108 | -0.084 | -0.065 |
| -0.703999999999997 | -0.105 | -0.082 | -0.064 |
| -0.699999999999997 | -0.103 | -0.081 | -0.063 |
| -0.695999999999997 | -0.101 | -0.079 | -0.062 |
| -0.691999999999997 | -0.098 | -0.077 | -0.061 |
| -0.687999999999997 | -0.096 | -0.076 | -0.06 |
| -0.683999999999997 | -0.094 | -0.074 | -0.059 |
| -0.679999999999997 | -0.092 | -0.073 | -0.058 |
| -0.675999999999997 | -0.089 | -0.071 | -0.057 |
| -0.671999999999997 | -0.087 | -0.07 | -0.056 |
| -0.667999999999997 | -0.085 | -0.068 | -0.054 |
| -0.663999999999997 | -0.083 | -0.067 | -0.053 |
| -0.659999999999997 | -0.081 | -0.065 | -0.052 |
| -0.655999999999997 | -0.079 | -0.064 | -0.051 |
| -0.651999999999997 | -0.077 | -0.062 | -0.05 |
| -0.647999999999997 | -0.075 | -0.061 | -0.049 |
| -0.643999999999997 | -0.073 | -0.059 | -0.048 |
| -0.639999999999997 | -0.071 | -0.058 | -0.047 |
| -0.635999999999997 | -0.069 | -0.057 | -0.046 |
| -0.631999999999997 | -0.068 | -0.055 | -0.045 |
| -0.627999999999997 | -0.066 | -0.054 | -0.044 |
| -0.623999999999997 | -0.064 | -0.053 | -0.043 |
| -0.619999999999997 | -0.062 | -0.051 | -0.042 |
| -0.615999999999997 | -0.061 | -0.05 | -0.042 |
| -0.611999999999997 | -0.059 | -0.049 | -0.041 |
| -0.607999999999997 | -0.057 | -0.048 | -0.04 |
| -0.603999999999997 | -0.056 | -0.047 | -0.039 |
| -0.599999999999997 | -0.054 | -0.045 | -0.038 |
| -0.595999999999997 | -0.053 | -0.044 | -0.037 |
| -0.591999999999997 | -0.051 | -0.043 | -0.036 |
| -0.587999999999997 | -0.05 | -0.042 | -0.035 |
| -0.583999999999997 | -0.048 | -0.041 | -0.034 |
| -0.579999999999997 | -0.047 | -0.04 | -0.033 |
| -0.575999999999997 | -0.046 | -0.039 | -0.033 |
| -0.571999999999997 | -0.044 | -0.037 | -0.032 |
| -0.567999999999997 | -0.043 | -0.036 | -0.031 |
| -0.563999999999997 | -0.042 | -0.035 | -0.03 |
| -0.559999999999997 | -0.04 | -0.034 | -0.029 |
| -0.555999999999997 | -0.039 | -0.033 | -0.029 |
| -0.551999999999997 | -0.038 | -0.032 | -0.028 |
| -0.547999999999997 | -0.037 | -0.031 | -0.027 |
| -0.543999999999997 | -0.035 | -0.031 | -0.026 |
| -0.539999999999997 | -0.034 | -0.03 | -0.026 |
| -0.535999999999997 | -0.033 | -0.029 | -0.025 |
| -0.531999999999997 | -0.032 | -0.028 | -0.024 |
| -0.527999999999997 | -0.031 | -0.027 | -0.023 |
| -0.523999999999997 | -0.03 | -0.026 | -0.023 |
| -0.519999999999997 | -0.029 | -0.025 | -0.022 |
| -0.515999999999997 | -0.028 | -0.025 | -0.021 |
| -0.511999999999997 | -0.027 | -0.024 | -0.021 |
| -0.507999999999997 | -0.026 | -0.023 | -0.02 |
| -0.503999999999997 | -0.025 | -0.022 | -0.02 |
| -0.499999999999997 | -0.024 | -0.021 | -0.019 |
| -0.495999999999997 | -0.023 | -0.021 | -0.018 |
| -0.491999999999997 | -0.023 | -0.02 | -0.018 |
| -0.487999999999997 | -0.022 | -0.019 | -0.017 |
| -0.483999999999997 | -0.021 | -0.019 | -0.017 |
| -0.479999999999997 | -0.02 | -0.018 | -0.016 |
| -0.475999999999997 | -0.019 | -0.017 | -0.016 |
| -0.471999999999997 | -0.019 | -0.017 | -0.015 |
| -0.467999999999997 | -0.018 | -0.016 | -0.014 |
| -0.463999999999997 | -0.017 | -0.016 | -0.014 |
| -0.459999999999997 | -0.017 | -0.015 | -0.013 |
| -0.455999999999997 | -0.016 | -0.014 | -0.013 |
| -0.451999999999997 | -0.015 | -0.014 | -0.013 |
| -0.447999999999997 | -0.015 | -0.013 | -0.012 |
| -0.443999999999997 | -0.014 | -0.013 | -0.012 |
| -0.439999999999997 | -0.014 | -0.012 | -0.011 |
| -0.435999999999997 | -0.013 | -0.012 | -0.011 |
| -0.431999999999997 | -0.012 | -0.011 | -0.01 |
| -0.427999999999997 | -0.012 | -0.011 | -0.01 |
| -0.423999999999997 | -0.011 | -0.01 | -0.01 |
| -0.419999999999997 | -0.011 | -0.01 | -0.009 |
| -0.415999999999997 | -0.01 | -0.01 | -0.009 |
| -0.411999999999997 | -0.01 | -0.009 | -0.008 |
| -0.407999999999997 | -0.01 | -0.009 | -0.008 |
| -0.403999999999997 | -0.009 | -0.008 | -0.008 |
| -0.399999999999997 | -0.009 | -0.008 | -0.007 |
| -0.395999999999997 | -0.008 | -0.008 | -0.007 |
| -0.391999999999997 | -0.008 | -0.007 | -0.007 |
| -0.387999999999997 | -0.008 | -0.007 | -0.007 |
| -0.383999999999997 | -0.007 | -0.007 | -0.006 |
| -0.379999999999997 | -0.007 | -0.006 | -0.006 |
| -0.375999999999997 | -0.007 | -0.006 | -0.006 |
| -0.371999999999997 | -0.006 | -0.006 | -0.005 |
| -0.367999999999997 | -0.006 | -0.006 | -0.005 |
| -0.363999999999997 | -0.006 | -0.005 | -0.005 |
| -0.359999999999997 | -0.005 | -0.005 | -0.005 |
| -0.355999999999997 | -0.005 | -0.005 | -0.004 |
| -0.351999999999997 | -0.005 | -0.004 | -0.004 |
| -0.347999999999997 | -0.005 | -0.004 | -0.004 |
| -0.343999999999997 | -0.004 | -0.004 | -0.004 |
| -0.339999999999997 | -0.004 | -0.004 | -0.004 |
| -0.335999999999997 | -0.004 | -0.004 | -0.003 |
| -0.331999999999997 | -0.004 | -0.003 | -0.003 |
| -0.327999999999997 | -0.003 | -0.003 | -0.003 |
| -0.323999999999997 | -0.003 | -0.003 | -0.003 |
| -0.319999999999997 | -0.003 | -0.003 | -0.003 |
| -0.315999999999997 | -0.003 | -0.003 | -0.003 |
| -0.311999999999997 | -0.003 | -0.003 | -0.002 |
| -0.307999999999997 | -0.003 | -0.002 | -0.002 |
| -0.303999999999997 | -0.002 | -0.002 | -0.002 |
| -0.299999999999997 | -0.002 | -0.002 | -0.002 |
| -0.295999999999997 | -0.002 | -0.002 | -0.002 |
| -0.291999999999997 | -0.002 | -0.002 | -0.002 |
| -0.287999999999997 | -0.002 | -0.002 | -0.002 |
| -0.283999999999997 | -0.002 | -0.002 | -0.002 |
| -0.279999999999997 | -0.002 | -0.002 | -0.001 |
| -0.275999999999997 | -0.001 | -0.001 | -0.001 |
| -0.271999999999997 | -0.001 | -0.001 | -0.001 |
| -0.267999999999997 | -0.001 | -0.001 | -0.001 |
| -0.263999999999997 | -0.001 | -0.001 | -0.001 |
| -0.259999999999997 | -0.001 | -0.001 | -0.001 |
| -0.255999999999997 | -0.001 | -0.001 | -0.001 |
| -0.251999999999997 | -0.001 | -0.001 | -0.001 |
| -0.247999999999997 | -0.001 | -0.001 | -0.001 |
| -0.243999999999997 | -0.001 | -0.001 | -0.001 |
| -0.239999999999997 | -0.001 | -0.001 | -0.001 |
| -0.235999999999997 | -0.001 | -0.001 | -0.001 |
| -0.231999999999997 | -0.001 | -0.001 | -0.001 |
| -0.227999999999997 | -0.001 | -0.001 | -0.001 |
| -0.223999999999997 | -0.001 | -0.001 | -0.001 |
| -0.219999999999997 | 0 | 0 | 0 |
| -0.215999999999997 | 0 | 0 | 0 |
| -0.211999999999997 | 0 | 0 | 0 |
| -0.207999999999997 | 0 | 0 | 0 |
| -0.203999999999997 | 0 | 0 | 0 |
| -0.199999999999997 | 0 | 0 | 0 |
| -0.195999999999997 | 0 | 0 | 0 |
| -0.191999999999997 | 0 | 0 | 0 |
| -0.187999999999997 | 0 | 0 | 0 |
| -0.183999999999997 | 0 | 0 | 0 |
| -0.179999999999997 | 0 | 0 | 0 |
| -0.175999999999997 | 0 | 0 | 0 |
| -0.171999999999997 | 0 | 0 | 0 |
| -0.167999999999997 | 0 | 0 | 0 |
| -0.163999999999997 | 0 | 0 | 0 |
| -0.159999999999997 | 0 | 0 | 0 |
| -0.155999999999997 | 0 | 0 | 0 |
| -0.151999999999997 | 0 | 0 | 0 |
| -0.147999999999997 | 0 | 0 | 0 |
| -0.143999999999997 | 0 | 0 | 0 |
| -0.139999999999997 | 0 | 0 | 0 |
| -0.135999999999997 | 0 | 0 | 0 |
| -0.131999999999997 | 0 | 0 | 0 |
| -0.127999999999997 | 0 | 0 | 0 |
| -0.123999999999997 | 0 | 0 | 0 |
| -0.119999999999997 | 0 | 0 | 0 |
| -0.115999999999997 | 0 | 0 | 0 |
| -0.111999999999997 | 0 | 0 | 0 |
| -0.107999999999997 | 0 | 0 | 0 |
| -0.103999999999997 | 0 | 0 | 0 |
| -0.0999999999999965 | 0 | 0 | 0 |
| -0.0959999999999965 | 0 | 0 | 0 |
| -0.0919999999999965 | 0 | 0 | 0 |
| -0.0879999999999965 | 0 | 0 | 0 |
| -0.0839999999999965 | 0 | 0 | 0 |
| -0.0799999999999965 | 0 | 0 | 0 |
| -0.0759999999999965 | 0 | 0 | 0 |
| -0.0719999999999965 | 0 | 0 | 0 |
| -0.0679999999999965 | 0 | 0 | 0 |
| -0.0639999999999965 | 0 | 0 | 0 |
| -0.0599999999999965 | 0 | 0 | 0 |
| -0.0559999999999965 | 0 | 0 | 0 |
| -0.0519999999999965 | 0 | 0 | 0 |
| -0.0479999999999965 | 0 | 0 | 0 |
| -0.0439999999999965 | 0 | 0 | 0 |
| -0.0399999999999965 | 0 | 0 | 0 |
| -0.0359999999999965 | 0 | 0 | 0 |
| -0.0319999999999965 | 0 | 0 | 0 |
| -0.0279999999999965 | 0 | 0 | 0 |
| -0.0239999999999965 | 0 | 0 | 0 |
| -0.0199999999999965 | 0 | 0 | 0 |
| -0.0159999999999965 | 0 | 0 | 0 |
| -0.0119999999999965 | 0 | 0 | 0 |
| -0.00799999999999647 | 0 | 0 | 0 |
| -0.00399999999999647 | 0 | 0 | 0 |
| 3.52495810318487e-15 | 0 | 0 | 0 |
| 0.00400000000000352 | 0 | 0 | 0 |
| 0.00800000000000352 | 0 | 0 | 0 |
| 0.0120000000000035 | 0 | 0 | 0 |
| 0.0160000000000035 | 0 | 0 | 0 |
| 0.0200000000000035 | 0 | 0 | 0 |
| 0.0240000000000035 | 0 | 0 | 0 |
| 0.0280000000000035 | 0 | 0 | 0 |
| 0.0320000000000035 | 0 | 0 | 0 |
| 0.0360000000000035 | 0 | 0 | 0 |
| 0.0400000000000035 | 0 | 0 | 0 |
| 0.0440000000000035 | 0 | 0 | 0 |
| 0.0480000000000035 | 0 | 0 | 0 |
| 0.0520000000000035 | 0 | 0 | 0 |
| 0.0560000000000035 | 0 | 0 | 0 |
| 0.0600000000000035 | 0 | 0 | 0 |
| 0.0640000000000035 | 0 | 0 | 0 |
| 0.0680000000000035 | 0 | 0 | 0 |
| 0.0720000000000036 | 0 | 0 | 0 |
| 0.0760000000000036 | 0 | 0 | 0 |
| 0.0800000000000036 | 0 | 0 | 0 |
| 0.0840000000000036 | 0 | 0 | 0 |
| 0.0880000000000036 | 0 | 0 | 0 |
| 0.0920000000000036 | 0 | 0 | 0 |
| 0.0960000000000036 | 0 | 0 | 0 |
| 0.100000000000004 | 0 | 0 | 0 |
| 0.104000000000004 | 0 | 0 | 0 |
| 0.108000000000004 | 0 | 0 | 0 |
| 0.112000000000004 | 0 | 0 | 0 |
| 0.116000000000004 | 0 | 0 | 0 |
| 0.120000000000004 | 0 | 0 | 0 |
| 0.124000000000004 | 0 | 0 | 0 |
| 0.128000000000004 | 0 | 0 | 0 |
| 0.132000000000004 | 0 | 0 | 0 |
| 0.136000000000004 | 0 | 0 | 0 |
| 0.140000000000004 | 0 | 0 | 0 |
| 0.144000000000004 | 0 | 0 | 0 |
| 0.148000000000004 | 0 | 0 | 0 |
| 0.152000000000004 | 0 | 0 | 0 |
| 0.156000000000004 | 0 | 0 | 0 |
| 0.160000000000004 | 0 | 0 | 0 |
| 0.164000000000004 | 0 | 0 | 0 |
| 0.168000000000004 | 0 | 0 | 0 |
| 0.172000000000004 | 0 | 0 | 0 |
| 0.176000000000004 | 0 | 0 | 0 |
| 0.180000000000004 | 0 | 0 | 0 |
| 0.184000000000004 | 0 | 0 | 0 |
| 0.188000000000004 | 0 | 0 | 0 |
| 0.192000000000004 | 0 | 0 | 0 |
| 0.196000000000004 | 0 | 0 | 0 |
| 0.200000000000004 | 0 | 0 | 0 |
| 0.204000000000004 | 0 | 0 | 0 |
| 0.208000000000004 | 0 | 0 | 0 |
| 0.212000000000004 | 0 | 0 | 0 |
| 0.216000000000004 | 0 | 0 | 0 |
| 0.220000000000004 | 0 | 0 | 0 |
| 0.224000000000004 | 0.001 | 0.001 | 0.001 |
| 0.228000000000004 | 0.001 | 0.001 | 0.001 |
| 0.232000000000004 | 0.001 | 0.001 | 0.001 |
| 0.236000000000004 | 0.001 | 0.001 | 0.001 |
| 0.240000000000004 | 0.001 | 0.001 | 0.001 |
| 0.244000000000004 | 0.001 | 0.001 | 0.001 |
| 0.248000000000004 | 0.001 | 0.001 | 0.001 |
| 0.252000000000004 | 0.001 | 0.001 | 0.001 |
| 0.256000000000004 | 0.001 | 0.001 | 0.001 |
| 0.260000000000004 | 0.001 | 0.001 | 0.001 |
| 0.264000000000004 | 0.001 | 0.001 | 0.001 |
| 0.268000000000004 | 0.001 | 0.001 | 0.001 |
| 0.272000000000004 | 0.001 | 0.001 | 0.001 |
| 0.276000000000004 | 0.001 | 0.001 | 0.001 |
| 0.280000000000004 | 0.002 | 0.002 | 0.001 |
| 0.284000000000004 | 0.002 | 0.002 | 0.002 |
| 0.288000000000004 | 0.002 | 0.002 | 0.002 |
| 0.292000000000004 | 0.002 | 0.002 | 0.002 |
| 0.296000000000004 | 0.002 | 0.002 | 0.002 |
| 0.300000000000004 | 0.002 | 0.002 | 0.002 |
| 0.304000000000004 | 0.002 | 0.002 | 0.002 |
| 0.308000000000004 | 0.003 | 0.002 | 0.002 |
| 0.312000000000004 | 0.003 | 0.003 | 0.002 |
| 0.316000000000004 | 0.003 | 0.003 | 0.003 |
| 0.320000000000004 | 0.003 | 0.003 | 0.003 |
| 0.324000000000004 | 0.003 | 0.003 | 0.003 |
| 0.328000000000004 | 0.003 | 0.003 | 0.003 |
| 0.332000000000004 | 0.004 | 0.003 | 0.003 |
| 0.336000000000004 | 0.004 | 0.004 | 0.003 |
| 0.340000000000004 | 0.004 | 0.004 | 0.004 |
| 0.344000000000004 | 0.004 | 0.004 | 0.004 |
| 0.348000000000004 | 0.005 | 0.004 | 0.004 |
| 0.352000000000004 | 0.005 | 0.004 | 0.004 |
| 0.356000000000004 | 0.005 | 0.005 | 0.004 |
| 0.360000000000004 | 0.005 | 0.005 | 0.005 |
| 0.364000000000004 | 0.006 | 0.005 | 0.005 |
| 0.368000000000004 | 0.006 | 0.006 | 0.005 |
| 0.372000000000004 | 0.006 | 0.006 | 0.005 |
| 0.376000000000004 | 0.007 | 0.006 | 0.006 |
| 0.380000000000004 | 0.007 | 0.006 | 0.006 |
| 0.384000000000004 | 0.007 | 0.007 | 0.006 |
| 0.388000000000004 | 0.008 | 0.007 | 0.007 |
| 0.392000000000004 | 0.008 | 0.007 | 0.007 |
| 0.396000000000004 | 0.008 | 0.008 | 0.007 |
| 0.400000000000004 | 0.009 | 0.008 | 0.007 |
| 0.404000000000004 | 0.009 | 0.008 | 0.008 |
| 0.408000000000004 | 0.01 | 0.009 | 0.008 |
| 0.412000000000004 | 0.01 | 0.009 | 0.008 |
| 0.416000000000004 | 0.01 | 0.01 | 0.009 |
| 0.420000000000004 | 0.011 | 0.01 | 0.009 |
| 0.424000000000004 | 0.011 | 0.01 | 0.01 |
| 0.428000000000004 | 0.012 | 0.011 | 0.01 |
| 0.432000000000004 | 0.012 | 0.011 | 0.01 |
| 0.436000000000004 | 0.013 | 0.012 | 0.011 |
| 0.440000000000004 | 0.014 | 0.012 | 0.011 |
| 0.444000000000004 | 0.014 | 0.013 | 0.012 |
| 0.448000000000004 | 0.015 | 0.013 | 0.012 |
| 0.452000000000004 | 0.015 | 0.014 | 0.013 |
| 0.456000000000004 | 0.016 | 0.014 | 0.013 |
| 0.460000000000004 | 0.017 | 0.015 | 0.013 |
| 0.464000000000004 | 0.017 | 0.016 | 0.014 |
| 0.468000000000004 | 0.018 | 0.016 | 0.014 |
| 0.472000000000004 | 0.019 | 0.017 | 0.015 |
| 0.476000000000004 | 0.019 | 0.017 | 0.016 |
| 0.480000000000004 | 0.02 | 0.018 | 0.016 |
| 0.484000000000004 | 0.021 | 0.019 | 0.017 |
| 0.488000000000004 | 0.022 | 0.019 | 0.017 |
| 0.492000000000004 | 0.023 | 0.02 | 0.018 |
| 0.496000000000004 | 0.023 | 0.021 | 0.018 |
| 0.500000000000004 | 0.024 | 0.021 | 0.019 |
| 0.504000000000004 | 0.025 | 0.022 | 0.02 |
| 0.508000000000004 | 0.026 | 0.023 | 0.02 |
| 0.512000000000004 | 0.027 | 0.024 | 0.021 |
| 0.516000000000004 | 0.028 | 0.025 | 0.021 |
| 0.520000000000004 | 0.029 | 0.025 | 0.022 |
| 0.524000000000004 | 0.03 | 0.026 | 0.023 |
| 0.528000000000004 | 0.031 | 0.027 | 0.023 |
| 0.532000000000004 | 0.032 | 0.028 | 0.024 |
| 0.536000000000004 | 0.033 | 0.029 | 0.025 |
| 0.540000000000004 | 0.034 | 0.03 | 0.026 |
| 0.544000000000004 | 0.035 | 0.031 | 0.026 |
| 0.548000000000004 | 0.037 | 0.031 | 0.027 |
| 0.552000000000004 | 0.038 | 0.032 | 0.028 |
| 0.556000000000004 | 0.039 | 0.033 | 0.029 |
| 0.560000000000004 | 0.04 | 0.034 | 0.029 |
| 0.564000000000004 | 0.042 | 0.035 | 0.03 |
| 0.568000000000004 | 0.043 | 0.036 | 0.031 |
| 0.572000000000004 | 0.044 | 0.037 | 0.032 |
| 0.576000000000004 | 0.046 | 0.039 | 0.033 |
| 0.580000000000004 | 0.047 | 0.04 | 0.033 |
| 0.584000000000004 | 0.048 | 0.041 | 0.034 |
| 0.588000000000004 | 0.05 | 0.042 | 0.035 |
| 0.592000000000004 | 0.051 | 0.043 | 0.036 |
| 0.596000000000004 | 0.053 | 0.044 | 0.037 |
| 0.600000000000004 | 0.054 | 0.045 | 0.038 |
| 0.604000000000004 | 0.056 | 0.047 | 0.039 |
| 0.608000000000004 | 0.057 | 0.048 | 0.04 |
| 0.612000000000004 | 0.059 | 0.049 | 0.041 |
| 0.616000000000004 | 0.061 | 0.05 | 0.042 |
| 0.620000000000004 | 0.062 | 0.051 | 0.042 |
| 0.624000000000004 | 0.064 | 0.053 | 0.043 |
| 0.628000000000004 | 0.066 | 0.054 | 0.044 |
| 0.632000000000004 | 0.068 | 0.055 | 0.045 |
| 0.636000000000004 | 0.069 | 0.057 | 0.046 |
| 0.640000000000004 | 0.071 | 0.058 | 0.047 |
| 0.644000000000004 | 0.073 | 0.059 | 0.048 |
| 0.648000000000004 | 0.075 | 0.061 | 0.049 |
| 0.652000000000004 | 0.077 | 0.062 | 0.05 |
| 0.656000000000004 | 0.079 | 0.064 | 0.051 |
| 0.660000000000004 | 0.081 | 0.065 | 0.052 |
| 0.664000000000004 | 0.083 | 0.067 | 0.053 |
| 0.668000000000004 | 0.085 | 0.068 | 0.054 |
| 0.672000000000004 | 0.087 | 0.07 | 0.056 |
| 0.676000000000004 | 0.089 | 0.071 | 0.057 |
| 0.680000000000004 | 0.092 | 0.073 | 0.058 |
| 0.684000000000004 | 0.094 | 0.074 | 0.059 |
| 0.688000000000004 | 0.096 | 0.076 | 0.06 |
| 0.692000000000004 | 0.098 | 0.077 | 0.061 |
| 0.696000000000004 | 0.101 | 0.079 | 0.062 |
| 0.700000000000004 | 0.103 | 0.081 | 0.063 |
| 0.704000000000004 | 0.105 | 0.082 | 0.064 |
| 0.708000000000004 | 0.108 | 0.084 | 0.065 |
| 0.712000000000004 | 0.11 | 0.086 | 0.066 |
| 0.716000000000004 | 0.113 | 0.087 | 0.067 |
| 0.720000000000004 | 0.115 | 0.089 | 0.069 |
| 0.724000000000004 | 0.118 | 0.091 | 0.07 |
| 0.728000000000004 | 0.12 | 0.092 | 0.071 |
| 0.732000000000004 | 0.123 | 0.094 | 0.072 |
| 0.736000000000004 | 0.126 | 0.096 | 0.073 |
| 0.740000000000004 | 0.128 | 0.098 | 0.074 |
| 0.744000000000004 | 0.131 | 0.099 | 0.075 |
| 0.748000000000004 | 0.134 | 0.101 | 0.076 |
| 0.752000000000004 | 0.137 | 0.103 | 0.078 |
| 0.756000000000004 | 0.139 | 0.105 | 0.079 |
| 0.760000000000004 | 0.142 | 0.107 | 0.08 |
| 0.764000000000004 | 0.145 | 0.108 | 0.081 |
| 0.768000000000004 | 0.148 | 0.11 | 0.082 |
| 0.772000000000004 | 0.151 | 0.112 | 0.083 |
| 0.776000000000004 | 0.154 | 0.114 | 0.084 |
| 0.780000000000004 | 0.157 | 0.116 | 0.086 |
| 0.784000000000004 | 0.16 | 0.118 | 0.087 |
| 0.788000000000004 | 0.163 | 0.12 | 0.088 |
| 0.792000000000004 | 0.166 | 0.122 | 0.089 |
| 0.796000000000004 | 0.17 | 0.124 | 0.09 |
| 0.800000000000004 | 0.173 | 0.125 | 0.091 |
| 0.804000000000004 | 0.176 | 0.127 | 0.092 |
| 0.808000000000004 | 0.179 | 0.129 | 0.093 |
| 0.812000000000004 | 0.183 | 0.131 | 0.094 |
| 0.816000000000004 | 0.186 | 0.133 | 0.096 |
| 0.820000000000004 | 0.189 | 0.135 | 0.097 |
| 0.824000000000004 | 0.193 | 0.137 | 0.098 |
| 0.828000000000004 | 0.196 | 0.139 | 0.099 |
| 0.832000000000004 | 0.2 | 0.141 | 0.1 |
| 0.836000000000004 | 0.203 | 0.143 | 0.101 |
| 0.840000000000004 | 0.207 | 0.145 | 0.102 |
| 0.844000000000004 | 0.21 | 0.147 | 0.103 |
| 0.848000000000004 | 0.214 | 0.149 | 0.104 |
| 0.852000000000004 | 0.217 | 0.151 | 0.105 |
| 0.856000000000004 | 0.221 | 0.153 | 0.106 |
| 0.860000000000004 | 0.225 | 0.155 | 0.107 |
| 0.864000000000004 | 0.228 | 0.157 | 0.108 |
| 0.868000000000004 | 0.232 | 0.159 | 0.109 |
| 0.872000000000004 | 0.236 | 0.161 | 0.11 |
| 0.876000000000004 | 0.239 | 0.163 | 0.111 |
| 0.880000000000004 | 0.243 | 0.165 | 0.112 |
| 0.884000000000004 | 0.247 | 0.167 | 0.113 |
| 0.888000000000004 | 0.251 | 0.169 | 0.114 |
| 0.892000000000004 | 0.255 | 0.171 | 0.115 |
| 0.896000000000004 | 0.259 | 0.173 | 0.116 |
| 0.900000000000004 | 0.263 | 0.175 | 0.117 |
| 0.904000000000004 | 0.267 | 0.177 | 0.118 |
| 0.908000000000004 | 0.271 | 0.179 | 0.119 |
| 0.912000000000004 | 0.275 | 0.181 | 0.12 |
| 0.916000000000004 | 0.279 | 0.183 | 0.12 |
| 0.920000000000004 | 0.283 | 0.185 | 0.121 |
| 0.924000000000004 | 0.287 | 0.187 | 0.122 |
| 0.928000000000004 | 0.291 | 0.189 | 0.123 |
| 0.932000000000004 | 0.295 | 0.191 | 0.124 |
| 0.936000000000004 | 0.299 | 0.193 | 0.125 |
| 0.940000000000004 | 0.303 | 0.195 | 0.125 |
| 0.944000000000004 | 0.307 | 0.197 | 0.126 |
| 0.948000000000004 | 0.312 | 0.199 | 0.127 |
| 0.952000000000004 | 0.316 | 0.201 | 0.128 |
| 0.956000000000004 | 0.32 | 0.203 | 0.128 |
| 0.960000000000004 | 0.324 | 0.205 | 0.129 |
| 0.964000000000004 | 0.329 | 0.207 | 0.13 |
| 0.968000000000004 | 0.333 | 0.208 | 0.13 |
| 0.972000000000004 | 0.337 | 0.21 | 0.131 |
| 0.976000000000004 | 0.342 | 0.212 | 0.132 |
| 0.980000000000004 | 0.346 | 0.214 | 0.132 |
| 0.984000000000004 | 0.35 | 0.216 | 0.133 |
| 0.988000000000004 | 0.355 | 0.218 | 0.134 |
| 0.992000000000004 | 0.359 | 0.22 | 0.134 |
| 0.996000000000004 | 0.363 | 0.221 | 0.135 |
| 1.000000000000004 | 0.368 | 0.223 | 0.135 |
| 1.004000000000004 | 0.372 | 0.225 | 0.136 |
| 1.008000000000004 | 0.377 | 0.227 | 0.136 |
| 1.012000000000004 | 0.381 | 0.228 | 0.137 |
| 1.016000000000004 | 0.386 | 0.23 | 0.137 |
| 1.020000000000004 | 0.39 | 0.232 | 0.138 |
| 1.024000000000004 | 0.395 | 0.234 | 0.138 |
| 1.028000000000004 | 0.399 | 0.235 | 0.139 |
| 1.032000000000004 | 0.404 | 0.237 | 0.139 |
| 1.036000000000004 | 0.408 | 0.239 | 0.139 |
| 1.040000000000004 | 0.413 | 0.24 | 0.14 |
| 1.044000000000004 | 0.417 | 0.242 | 0.14 |
| 1.048000000000004 | 0.422 | 0.243 | 0.141 |
| 1.052000000000004 | 0.426 | 0.245 | 0.141 |
| 1.056000000000004 | 0.431 | 0.247 | 0.141 |
| 1.060000000000004 | 0.435 | 0.248 | 0.141 |
| 1.064000000000004 | 0.44 | 0.25 | 0.142 |
| 1.068000000000004 | 0.444 | 0.251 | 0.142 |
| 1.072000000000004 | 0.449 | 0.253 | 0.142 |
| 1.076000000000004 | 0.453 | 0.254 | 0.142 |
| 1.080000000000004 | 0.458 | 0.255 | 0.143 |
| 1.084000000000004 | 0.462 | 0.257 | 0.143 |
| 1.088000000000004 | 0.467 | 0.258 | 0.143 |
| 1.092000000000004 | 0.471 | 0.26 | 0.143 |
| 1.096000000000004 | 0.476 | 0.261 | 0.143 |
| 1.100000000000004 | 0.48 | 0.262 | 0.143 |
| 1.104000000000004 | 0.485 | 0.264 | 0.143 |
| 1.108000000000004 | 0.489 | 0.265 | 0.143 |
| 1.112000000000004 | 0.494 | 0.266 | 0.143 |
| 1.116000000000004 | 0.498 | 0.267 | 0.143 |
| 1.120000000000004 | 0.503 | 0.268 | 0.143 |
| 1.124000000000004 | 0.507 | 0.27 | 0.143 |
| 1.128000000000004 | 0.512 | 0.271 | 0.143 |
| 1.132000000000004 | 0.516 | 0.272 | 0.143 |
| 1.136000000000004 | 0.521 | 0.273 | 0.143 |
| 1.140000000000004 | 0.525 | 0.274 | 0.143 |
| 1.144000000000004 | 0.529 | 0.275 | 0.143 |
| 1.148000000000004 | 0.534 | 0.276 | 0.143 |
| 1.152000000000004 | 0.538 | 0.277 | 0.143 |
| 1.156000000000004 | 0.543 | 0.278 | 0.143 |
| 1.160000000000004 | 0.547 | 0.279 | 0.142 |
| 1.164000000000004 | 0.551 | 0.28 | 0.142 |
| 1.168000000000004 | 0.556 | 0.281 | 0.142 |
| 1.172000000000004 | 0.56 | 0.282 | 0.142 |
| 1.176000000000004 | 0.564 | 0.283 | 0.142 |
| 1.180000000000004 | 0.568 | 0.283 | 0.141 |
| 1.184000000000004 | 0.573 | 0.284 | 0.141 |
| 1.188000000000004 | 0.577 | 0.285 | 0.141 |
| 1.192000000000004 | 0.581 | 0.286 | 0.14 |
| 1.196000000000004 | 0.585 | 0.286 | 0.14 |
| 1.200000000000004 | 0.59 | 0.287 | 0.14 |
| 1.204000000000004 | 0.594 | 0.288 | 0.139 |
| 1.208000000000004 | 0.598 | 0.288 | 0.139 |
| 1.212000000000004 | 0.602 | 0.289 | 0.139 |
| 1.216000000000004 | 0.606 | 0.289 | 0.138 |
| 1.220000000000004 | 0.61 | 0.29 | 0.138 |
| 1.224000000000004 | 0.614 | 0.29 | 0.137 |
| 1.228000000000004 | 0.618 | 0.291 | 0.137 |
| 1.232000000000004 | 0.622 | 0.291 | 0.136 |
| 1.236000000000004 | 0.626 | 0.292 | 0.136 |
| 1.240000000000004 | 0.63 | 0.292 | 0.135 |
| 1.244000000000004 | 0.634 | 0.292 | 0.135 |
| 1.248000000000004 | 0.638 | 0.293 | 0.134 |
| 1.252000000000004 | 0.642 | 0.293 | 0.134 |
| 1.256000000000004 | 0.645 | 0.293 | 0.133 |
| 1.260000000000004 | 0.649 | 0.294 | 0.133 |
| 1.264000000000004 | 0.653 | 0.294 | 0.132 |
| 1.268000000000004 | 0.657 | 0.294 | 0.132 |
| 1.272000000000004 | 0.66 | 0.294 | 0.131 |
| 1.276000000000004 | 0.664 | 0.294 | 0.13 |
| 1.280000000000004 | 0.668 | 0.294 | 0.13 |
| 1.284000000000004 | 0.671 | 0.294 | 0.129 |
| 1.288000000000004 | 0.675 | 0.294 | 0.128 |
| 1.292000000000004 | 0.678 | 0.294 | 0.128 |
| 1.296000000000004 | 0.682 | 0.294 | 0.127 |
| 1.300000000000004 | 0.685 | 0.294 | 0.126 |
| 1.304000000000004 | 0.689 | 0.294 | 0.126 |
| 1.308000000000004 | 0.692 | 0.294 | 0.125 |
| 1.312000000000004 | 0.695 | 0.294 | 0.124 |
| 1.316000000000004 | 0.698 | 0.294 | 0.124 |
| 1.320000000000004 | 0.702 | 0.294 | 0.123 |
| 1.324000000000004 | 0.705 | 0.293 | 0.122 |
| 1.328000000000004 | 0.708 | 0.293 | 0.121 |
| 1.332000000000004 | 0.711 | 0.293 | 0.121 |
| 1.336000000000004 | 0.714 | 0.293 | 0.12 |
| 1.340000000000004 | 0.717 | 0.292 | 0.119 |
| 1.344000000000004 | 0.72 | 0.292 | 0.118 |
| 1.348000000000004 | 0.723 | 0.292 | 0.118 |
| 1.352000000000004 | 0.726 | 0.291 | 0.117 |
| 1.356000000000004 | 0.729 | 0.291 | 0.116 |
| 1.360000000000004 | 0.732 | 0.29 | 0.115 |
| 1.364000000000004 | 0.735 | 0.29 | 0.114 |
| 1.368000000000004 | 0.737 | 0.289 | 0.113 |
| 1.372000000000004 | 0.74 | 0.289 | 0.113 |
| 1.376000000000004 | 0.743 | 0.288 | 0.112 |
| 1.380000000000004 | 0.745 | 0.288 | 0.111 |
| 1.384000000000004 | 0.748 | 0.287 | 0.11 |
| 1.388000000000005 | 0.75 | 0.286 | 0.109 |
| 1.392000000000004 | 0.753 | 0.286 | 0.108 |
| 1.396000000000004 | 0.755 | 0.285 | 0.108 |
| 1.400000000000005 | 0.758 | 0.284 | 0.107 |
| 1.404000000000005 | 0.76 | 0.284 | 0.106 |
| 1.408000000000005 | 0.762 | 0.283 | 0.105 |
| 1.412000000000005 | 0.764 | 0.282 | 0.104 |
| 1.416000000000005 | 0.767 | 0.281 | 0.103 |
| 1.420000000000005 | 0.769 | 0.28 | 0.102 |
| 1.424000000000005 | 0.771 | 0.28 | 0.101 |
| 1.428000000000005 | 0.773 | 0.279 | 0.101 |
| 1.432000000000005 | 0.775 | 0.278 | 0.1 |
| 1.436000000000005 | 0.777 | 0.277 | 0.099 |
| 1.440000000000005 | 0.779 | 0.276 | 0.098 |
| 1.444000000000005 | 0.78 | 0.275 | 0.097 |
| 1.448000000000005 | 0.782 | 0.274 | 0.096 |
| 1.452000000000005 | 0.784 | 0.273 | 0.095 |
| 1.456000000000005 | 0.785 | 0.272 | 0.094 |
| 1.460000000000005 | 0.787 | 0.271 | 0.093 |
| 1.464000000000005 | 0.789 | 0.27 | 0.092 |
| 1.468000000000005 | 0.79 | 0.269 | 0.092 |
| 1.472000000000005 | 0.792 | 0.268 | 0.091 |
| 1.476000000000005 | 0.793 | 0.267 | 0.09 |
| 1.480000000000005 | 0.794 | 0.266 | 0.089 |
| 1.484000000000005 | 0.796 | 0.265 | 0.088 |
| 1.488000000000005 | 0.797 | 0.263 | 0.087 |
| 1.492000000000005 | 0.798 | 0.262 | 0.086 |
| 1.496000000000005 | 0.799 | 0.261 | 0.085 |
| 1.500000000000005 | 0.8 | 0.26 | 0.084 |
| 1.504000000000005 | 0.801 | 0.259 | 0.083 |
| 1.508000000000005 | 0.802 | 0.257 | 0.083 |
| 1.512000000000005 | 0.803 | 0.256 | 0.082 |
| 1.516000000000005 | 0.804 | 0.255 | 0.081 |
| 1.520000000000005 | 0.805 | 0.254 | 0.08 |
| 1.524000000000005 | 0.806 | 0.252 | 0.079 |
| 1.528000000000005 | 0.807 | 0.251 | 0.078 |
| 1.532000000000005 | 0.807 | 0.25 | 0.077 |
| 1.536000000000005 | 0.808 | 0.248 | 0.076 |
| 1.540000000000005 | 0.808 | 0.247 | 0.075 |
| 1.544000000000005 | 0.809 | 0.246 | 0.075 |
| 1.548000000000005 | 0.809 | 0.244 | 0.074 |
| 1.552000000000005 | 0.81 | 0.243 | 0.073 |
| 1.556000000000005 | 0.81 | 0.241 | 0.072 |
| 1.560000000000005 | 0.81 | 0.24 | 0.071 |
| 1.564000000000005 | 0.811 | 0.239 | 0.07 |
| 1.568000000000005 | 0.811 | 0.237 | 0.069 |
| 1.572000000000005 | 0.811 | 0.236 | 0.069 |
| 1.576000000000005 | 0.811 | 0.234 | 0.068 |
| 1.580000000000005 | 0.811 | 0.233 | 0.067 |
| 1.584000000000005 | 0.811 | 0.231 | 0.066 |
| 1.588000000000005 | 0.811 | 0.23 | 0.065 |
| 1.592000000000005 | 0.811 | 0.228 | 0.064 |
| 1.596000000000005 | 0.811 | 0.227 | 0.063 |
| 1.600000000000005 | 0.811 | 0.225 | 0.063 |
| 1.604000000000005 | 0.81 | 0.224 | 0.062 |
| 1.608000000000005 | 0.81 | 0.222 | 0.061 |
| 1.612000000000005 | 0.81 | 0.221 | 0.06 |
| 1.616000000000005 | 0.809 | 0.219 | 0.059 |
| 1.620000000000005 | 0.809 | 0.218 | 0.059 |
| 1.624000000000005 | 0.808 | 0.216 | 0.058 |
| 1.628000000000005 | 0.808 | 0.215 | 0.057 |
| 1.632000000000005 | 0.807 | 0.213 | 0.056 |
| 1.636000000000005 | 0.806 | 0.212 | 0.055 |
| 1.640000000000005 | 0.806 | 0.21 | 0.055 |
| 1.644000000000005 | 0.805 | 0.208 | 0.054 |
| 1.648000000000005 | 0.804 | 0.207 | 0.053 |
| 1.652000000000005 | 0.803 | 0.205 | 0.052 |
| 1.656000000000005 | 0.802 | 0.204 | 0.052 |
| 1.660000000000005 | 0.801 | 0.202 | 0.051 |
| 1.664000000000005 | 0.8 | 0.2 | 0.05 |
| 1.668000000000005 | 0.799 | 0.199 | 0.049 |
| 1.672000000000005 | 0.798 | 0.197 | 0.049 |
| 1.676000000000005 | 0.797 | 0.196 | 0.048 |
| 1.680000000000005 | 0.796 | 0.194 | 0.047 |
| 1.684000000000005 | 0.795 | 0.192 | 0.047 |
| 1.688000000000005 | 0.793 | 0.191 | 0.046 |
| 1.692000000000005 | 0.792 | 0.189 | 0.045 |
| 1.696000000000005 | 0.791 | 0.188 | 0.045 |
| 1.700000000000005 | 0.789 | 0.186 | 0.044 |
| 1.704000000000005 | 0.788 | 0.184 | 0.043 |
| 1.708000000000005 | 0.786 | 0.183 | 0.043 |
| 1.712000000000005 | 0.785 | 0.181 | 0.042 |
| 1.716000000000005 | 0.783 | 0.18 | 0.041 |
| 1.720000000000005 | 0.781 | 0.178 | 0.041 |
| 1.724000000000005 | 0.78 | 0.176 | 0.04 |
| 1.728000000000005 | 0.778 | 0.175 | 0.039 |
| 1.732000000000005 | 0.776 | 0.173 | 0.039 |
| 1.736000000000005 | 0.774 | 0.172 | 0.038 |
| 1.740000000000005 | 0.772 | 0.17 | 0.037 |
| 1.744000000000005 | 0.771 | 0.168 | 0.037 |
| 1.748000000000005 | 0.769 | 0.167 | 0.036 |
| 1.752000000000005 | 0.767 | 0.165 | 0.036 |
| 1.756000000000005 | 0.765 | 0.164 | 0.035 |
| 1.760000000000005 | 0.763 | 0.162 | 0.034 |
| 1.764000000000005 | 0.761 | 0.16 | 0.034 |
| 1.768000000000005 | 0.758 | 0.159 | 0.033 |
| 1.772000000000005 | 0.756 | 0.157 | 0.033 |
| 1.776000000000005 | 0.754 | 0.156 | 0.032 |
| 1.780000000000005 | 0.752 | 0.154 | 0.032 |
| 1.784000000000005 | 0.749 | 0.153 | 0.031 |
| 1.788000000000005 | 0.747 | 0.151 | 0.031 |
| 1.792000000000005 | 0.745 | 0.15 | 0.03 |
| 1.796000000000005 | 0.742 | 0.148 | 0.029 |
| 1.800000000000005 | 0.74 | 0.146 | 0.029 |
| 1.804000000000005 | 0.738 | 0.145 | 0.028 |
| 1.808000000000005 | 0.735 | 0.143 | 0.028 |
| 1.812000000000005 | 0.733 | 0.142 | 0.027 |
| 1.816000000000005 | 0.73 | 0.14 | 0.027 |
| 1.820000000000005 | 0.727 | 0.139 | 0.026 |
| 1.824000000000005 | 0.725 | 0.137 | 0.026 |
| 1.828000000000005 | 0.722 | 0.136 | 0.026 |
| 1.832000000000005 | 0.72 | 0.134 | 0.025 |
| 1.836000000000005 | 0.717 | 0.133 | 0.025 |
| 1.840000000000005 | 0.714 | 0.131 | 0.024 |
| 1.844000000000005 | 0.711 | 0.13 | 0.024 |
| 1.848000000000005 | 0.709 | 0.128 | 0.023 |
| 1.852000000000005 | 0.706 | 0.127 | 0.023 |
| 1.856000000000005 | 0.703 | 0.126 | 0.022 |
| 1.860000000000005 | 0.7 | 0.124 | 0.022 |
| 1.864000000000005 | 0.697 | 0.123 | 0.022 |
| 1.868000000000005 | 0.694 | 0.121 | 0.021 |
| 1.872000000000005 | 0.691 | 0.12 | 0.021 |
| 1.876000000000005 | 0.688 | 0.118 | 0.02 |
| 1.880000000000005 | 0.685 | 0.117 | 0.02 |
| 1.884000000000005 | 0.682 | 0.116 | 0.02 |
| 1.888000000000005 | 0.679 | 0.114 | 0.019 |
| 1.892000000000005 | 0.676 | 0.113 | 0.019 |
| 1.896000000000005 | 0.673 | 0.112 | 0.018 |
| 1.900000000000005 | 0.67 | 0.11 | 0.018 |
| 1.904000000000005 | 0.667 | 0.109 | 0.018 |
| 1.908000000000005 | 0.664 | 0.107 | 0.017 |
| 1.912000000000005 | 0.66 | 0.106 | 0.017 |
| 1.916000000000005 | 0.657 | 0.105 | 0.017 |
| 1.920000000000005 | 0.654 | 0.104 | 0.016 |
| 1.924000000000005 | 0.651 | 0.102 | 0.016 |
| 1.928000000000005 | 0.647 | 0.101 | 0.016 |
| 1.932000000000005 | 0.644 | 0.1 | 0.015 |
| 1.936000000000005 | 0.641 | 0.098 | 0.015 |
| 1.940000000000005 | 0.638 | 0.097 | 0.015 |
| 1.944000000000005 | 0.634 | 0.096 | 0.014 |
| 1.948000000000005 | 0.631 | 0.095 | 0.014 |
| 1.952000000000005 | 0.627 | 0.093 | 0.014 |
| 1.956000000000005 | 0.624 | 0.092 | 0.014 |
| 1.960000000000005 | 0.621 | 0.091 | 0.013 |
| 1.964000000000005 | 0.617 | 0.09 | 0.013 |
| 1.968000000000005 | 0.614 | 0.089 | 0.013 |
| 1.972000000000005 | 0.61 | 0.087 | 0.012 |
| 1.976000000000005 | 0.607 | 0.086 | 0.012 |
| 1.980000000000005 | 0.604 | 0.085 | 0.012 |
| 1.984000000000005 | 0.6 | 0.084 | 0.012 |
| 1.988000000000005 | 0.597 | 0.083 | 0.011 |
| 1.992000000000005 | 0.593 | 0.082 | 0.011 |
| 1.996000000000005 | 0.59 | 0.08 | 0.011 |
| 2.000000000000005 | 0.586 | 0.079 | 0.011 |
| 2.004000000000005 | 0.583 | 0.078 | 0.011 |
| 2.008000000000005 | 0.579 | 0.077 | 0.01 |
| 2.012000000000005 | 0.576 | 0.076 | 0.01 |
| 2.016000000000005 | 0.572 | 0.075 | 0.01 |
| 2.020000000000005 | 0.568 | 0.074 | 0.01 |
| 2.024000000000005 | 0.565 | 0.073 | 0.009 |
| 2.028000000000005 | 0.561 | 0.072 | 0.009 |
| 2.032000000000005 | 0.558 | 0.071 | 0.009 |
| 2.036000000000005 | 0.554 | 0.07 | 0.009 |
| 2.040000000000005 | 0.551 | 0.069 | 0.009 |
| 2.044000000000005 | 0.547 | 0.068 | 0.008 |
| 2.048000000000005 | 0.543 | 0.067 | 0.008 |
| 2.052000000000005 | 0.54 | 0.066 | 0.008 |
| 2.056000000000005 | 0.536 | 0.065 | 0.008 |
| 2.060000000000005 | 0.533 | 0.064 | 0.008 |
| 2.064000000000005 | 0.529 | 0.063 | 0.007 |
| 2.068000000000005 | 0.525 | 0.062 | 0.007 |
| 2.072000000000005 | 0.522 | 0.061 | 0.007 |
| 2.076000000000005 | 0.518 | 0.06 | 0.007 |
| 2.080000000000005 | 0.514 | 0.059 | 0.007 |
| 2.084000000000005 | 0.511 | 0.058 | 0.007 |
| 2.088000000000005 | 0.507 | 0.057 | 0.006 |
| 2.092000000000005 | 0.504 | 0.056 | 0.006 |
| 2.096000000000005 | 0.5 | 0.056 | 0.006 |
| 2.100000000000005 | 0.496 | 0.055 | 0.006 |
| 2.104000000000005 | 0.493 | 0.054 | 0.006 |
| 2.108000000000005 | 0.489 | 0.053 | 0.006 |
| 2.112000000000005 | 0.486 | 0.052 | 0.006 |
| 2.116000000000005 | 0.482 | 0.051 | 0.005 |
| 2.120000000000005 | 0.478 | 0.051 | 0.005 |
| 2.124000000000005 | 0.475 | 0.05 | 0.005 |
| 2.128000000000005 | 0.471 | 0.049 | 0.005 |
| 2.132000000000005 | 0.468 | 0.048 | 0.005 |
| 2.136000000000005 | 0.464 | 0.047 | 0.005 |
| 2.140000000000005 | 0.46 | 0.047 | 0.005 |
| 2.144000000000005 | 0.457 | 0.046 | 0.005 |
| 2.148000000000005 | 0.453 | 0.045 | 0.004 |
| 2.152000000000005 | 0.45 | 0.044 | 0.004 |
| 2.156000000000005 | 0.446 | 0.044 | 0.004 |
| 2.160000000000005 | 0.443 | 0.043 | 0.004 |
| 2.164000000000005 | 0.439 | 0.042 | 0.004 |
| 2.168000000000005 | 0.436 | 0.042 | 0.004 |
| 2.172000000000005 | 0.432 | 0.041 | 0.004 |
| 2.176000000000005 | 0.428 | 0.04 | 0.004 |
| 2.180000000000005 | 0.425 | 0.039 | 0.004 |
| 2.184000000000005 | 0.421 | 0.039 | 0.004 |
| 2.188000000000005 | 0.418 | 0.038 | 0.003 |
| 2.192000000000005 | 0.414 | 0.038 | 0.003 |
| 2.196000000000005 | 0.411 | 0.037 | 0.003 |
| 2.200000000000005 | 0.408 | 0.036 | 0.003 |
| 2.204000000000005 | 0.404 | 0.036 | 0.003 |
| 2.208000000000005 | 0.401 | 0.035 | 0.003 |
| 2.212000000000005 | 0.397 | 0.034 | 0.003 |
| 2.216000000000005 | 0.394 | 0.034 | 0.003 |
| 2.220000000000005 | 0.39 | 0.033 | 0.003 |
| 2.224000000000005 | 0.387 | 0.033 | 0.003 |
| 2.228000000000005 | 0.383 | 0.032 | 0.003 |
| 2.232000000000005 | 0.38 | 0.031 | 0.003 |
| 2.236000000000005 | 0.377 | 0.031 | 0.003 |
| 2.240000000000005 | 0.373 | 0.03 | 0.002 |
| 2.244000000000005 | 0.37 | 0.03 | 0.002 |
| 2.248000000000005 | 0.367 | 0.029 | 0.002 |
| 2.252000000000005 | 0.363 | 0.029 | 0.002 |
| 2.256000000000005 | 0.36 | 0.028 | 0.002 |
| 2.260000000000005 | 0.357 | 0.028 | 0.002 |
| 2.264000000000005 | 0.353 | 0.027 | 0.002 |
| 2.268000000000005 | 0.35 | 0.027 | 0.002 |
| 2.272000000000005 | 0.347 | 0.026 | 0.002 |
| 2.276000000000005 | 0.344 | 0.026 | 0.002 |
| 2.280000000000005 | 0.34 | 0.025 | 0.002 |
| 2.284000000000005 | 0.337 | 0.025 | 0.002 |
| 2.288000000000005 | 0.334 | 0.024 | 0.002 |
| 2.292000000000005 | 0.331 | 0.024 | 0.002 |
| 2.296000000000005 | 0.328 | 0.023 | 0.002 |
| 2.300000000000005 | 0.325 | 0.023 | 0.002 |
| 2.304000000000005 | 0.321 | 0.023 | 0.002 |
| 2.308000000000005 | 0.318 | 0.022 | 0.002 |
| 2.312000000000005 | 0.315 | 0.022 | 0.002 |
| 2.316000000000005 | 0.312 | 0.021 | 0.001 |
| 2.320000000000005 | 0.309 | 0.021 | 0.001 |
| 2.324000000000005 | 0.306 | 0.021 | 0.001 |
| 2.328000000000005 | 0.303 | 0.02 | 0.001 |
| 2.332000000000005 | 0.3 | 0.02 | 0.001 |
| 2.336000000000005 | 0.297 | 0.019 | 0.001 |
| 2.340000000000005 | 0.294 | 0.019 | 0.001 |
| 2.344000000000005 | 0.291 | 0.019 | 0.001 |
| 2.348000000000005 | 0.288 | 0.018 | 0.001 |
| 2.352000000000005 | 0.285 | 0.018 | 0.001 |
| 2.356000000000005 | 0.282 | 0.018 | 0.001 |
| 2.360000000000005 | 0.279 | 0.017 | 0.001 |
| 2.364000000000005 | 0.276 | 0.017 | 0.001 |
| 2.368000000000005 | 0.273 | 0.017 | 0.001 |
| 2.372000000000005 | 0.27 | 0.016 | 0.001 |
| 2.376000000000005 | 0.268 | 0.016 | 0.001 |
| 2.380000000000005 | 0.265 | 0.016 | 0.001 |
| 2.384000000000005 | 0.262 | 0.015 | 0.001 |
| 2.388000000000005 | 0.259 | 0.015 | 0.001 |
| 2.392000000000005 | 0.256 | 0.015 | 0.001 |
| 2.396000000000005 | 0.254 | 0.014 | 0.001 |
| 2.400000000000005 | 0.251 | 0.014 | 0.001 |
| 2.404000000000005 | 0.248 | 0.014 | 0.001 |
| 2.408000000000005 | 0.245 | 0.014 | 0.001 |
| 2.412000000000005 | 0.243 | 0.013 | 0.001 |
| 2.416000000000005 | 0.24 | 0.013 | 0.001 |
| 2.420000000000005 | 0.238 | 0.013 | 0.001 |
| 2.424000000000005 | 0.235 | 0.012 | 0.001 |
| 2.428000000000005 | 0.232 | 0.012 | 0.001 |
| 2.432000000000005 | 0.23 | 0.012 | 0.001 |
| 2.436000000000005 | 0.227 | 0.012 | 0.001 |
| 2.440000000000005 | 0.225 | 0.011 | 0.001 |
| 2.444000000000005 | 0.222 | 0.011 | 0.001 |
| 2.448000000000005 | 0.22 | 0.011 | 0.001 |
| 2.452000000000005 | 0.217 | 0.011 | 0.001 |
| 2.456000000000005 | 0.215 | 0.011 | 0.001 |
| 2.460000000000005 | 0.212 | 0.01 | 0 |
| 2.464000000000005 | 0.21 | 0.01 | 0 |
| 2.468000000000005 | 0.207 | 0.01 | 0 |
| 2.472000000000005 | 0.205 | 0.01 | 0 |
| 2.476000000000005 | 0.202 | 0.009 | 0 |
| 2.480000000000005 | 0.2 | 0.009 | 0 |
| 2.484000000000005 | 0.198 | 0.009 | 0 |
| 2.488000000000005 | 0.195 | 0.009 | 0 |
| 2.492000000000005 | 0.193 | 0.009 | 0 |
| 2.496000000000005 | 0.191 | 0.008 | 0 |
| 2.500000000000005 | 0.189 | 0.008 | 0 |
| 2.504000000000005 | 0.186 | 0.008 | 0 |
| 2.508000000000005 | 0.184 | 0.008 | 0 |
| 2.512000000000005 | 0.182 | 0.008 | 0 |
| 2.516000000000005 | 0.18 | 0.008 | 0 |
| 2.520000000000005 | 0.177 | 0.007 | 0 |
| 2.524000000000005 | 0.175 | 0.007 | 0 |
| 2.528000000000005 | 0.173 | 0.007 | 0 |
| 2.532000000000005 | 0.171 | 0.007 | 0 |
| 2.536000000000005 | 0.169 | 0.007 | 0 |
| 2.540000000000005 | 0.167 | 0.007 | 0 |
| 2.544000000000005 | 0.165 | 0.006 | 0 |
| 2.548000000000005 | 0.163 | 0.006 | 0 |
| 2.552000000000005 | 0.161 | 0.006 | 0 |
| 2.556000000000005 | 0.159 | 0.006 | 0 |
| 2.560000000000005 | 0.157 | 0.006 | 0 |
| 2.564000000000005 | 0.155 | 0.006 | 0 |
| 2.568000000000005 | 0.153 | 0.006 | 0 |
| 2.572000000000005 | 0.151 | 0.006 | 0 |
| 2.576000000000005 | 0.149 | 0.005 | 0 |
| 2.580000000000005 | 0.147 | 0.005 | 0 |
| 2.584000000000005 | 0.145 | 0.005 | 0 |
| 2.588000000000005 | 0.143 | 0.005 | 0 |
| 2.592000000000005 | 0.141 | 0.005 | 0 |
| 2.596000000000005 | 0.14 | 0.005 | 0 |
| 2.600000000000005 | 0.138 | 0.005 | 0 |
| 2.604000000000005 | 0.136 | 0.005 | 0 |
| 2.608000000000005 | 0.134 | 0.004 | 0 |
| 2.612000000000005 | 0.132 | 0.004 | 0 |
| 2.616000000000005 | 0.131 | 0.004 | 0 |
| 2.620000000000005 | 0.129 | 0.004 | 0 |
| 2.624000000000005 | 0.127 | 0.004 | 0 |
| 2.628000000000005 | 0.126 | 0.004 | 0 |
| 2.632000000000005 | 0.124 | 0.004 | 0 |
| 2.636000000000005 | 0.122 | 0.004 | 0 |
| 2.640000000000005 | 0.121 | 0.004 | 0 |
| 2.644000000000005 | 0.119 | 0.004 | 0 |
| 2.648000000000005 | 0.117 | 0.004 | 0 |
| 2.652000000000005 | 0.116 | 0.003 | 0 |
| 2.656000000000005 | 0.114 | 0.003 | 0 |
| 2.660000000000005 | 0.113 | 0.003 | 0 |
| 2.664000000000005 | 0.111 | 0.003 | 0 |
| 2.668000000000005 | 0.11 | 0.003 | 0 |
| 2.672000000000005 | 0.108 | 0.003 | 0 |
| 2.676000000000005 | 0.107 | 0.003 | 0 |
| 2.680000000000005 | 0.105 | 0.003 | 0 |
| 2.684000000000005 | 0.104 | 0.003 | 0 |
| 2.688000000000005 | 0.102 | 0.003 | 0 |
| 2.692000000000005 | 0.101 | 0.003 | 0 |
| 2.696000000000005 | 0.099 | 0.003 | 0 |
| 2.700000000000005 | 0.098 | 0.003 | 0 |
| 2.704000000000005 | 0.097 | 0.002 | 0 |
| 2.708000000000005 | 0.095 | 0.002 | 0 |
| 2.712000000000005 | 0.094 | 0.002 | 0 |
| 2.716000000000005 | 0.092 | 0.002 | 0 |
| 2.720000000000005 | 0.091 | 0.002 | 0 |
| 2.724000000000005 | 0.09 | 0.002 | 0 |
| 2.728000000000005 | 0.089 | 0.002 | 0 |
| 2.732000000000005 | 0.087 | 0.002 | 0 |
| 2.736000000000005 | 0.086 | 0.002 | 0 |
| 2.740000000000005 | 0.085 | 0.002 | 0 |
| 2.744000000000005 | 0.084 | 0.002 | 0 |
| 2.748000000000005 | 0.082 | 0.002 | 0 |
| 2.752000000000005 | 0.081 | 0.002 | 0 |
| 2.756000000000005 | 0.08 | 0.002 | 0 |
| 2.760000000000005 | 0.079 | 0.002 | 0 |
| 2.764000000000005 | 0.078 | 0.002 | 0 |
| 2.768000000000005 | 0.076 | 0.002 | 0 |
| 2.772000000000005 | 0.075 | 0.002 | 0 |
| 2.776000000000005 | 0.074 | 0.002 | 0 |
| 2.780000000000005 | 0.073 | 0.002 | 0 |
| 2.784000000000005 | 0.072 | 0.001 | 0 |
| 2.788000000000006 | 0.071 | 0.001 | 0 |
| 2.792000000000005 | 0.07 | 0.001 | 0 |
| 2.796000000000005 | 0.069 | 0.001 | 0 |
| 2.800000000000006 | 0.068 | 0.001 | 0 |
| 2.804000000000006 | 0.067 | 0.001 | 0 |
| 2.808000000000006 | 0.066 | 0.001 | 0 |
| 2.812000000000006 | 0.065 | 0.001 | 0 |
| 2.816000000000006 | 0.064 | 0.001 | 0 |
| 2.820000000000006 | 0.063 | 0.001 | 0 |
| 2.824000000000006 | 0.062 | 0.001 | 0 |
| 2.828000000000006 | 0.061 | 0.001 | 0 |
| 2.832000000000006 | 0.06 | 0.001 | 0 |
| 2.836000000000006 | 0.059 | 0.001 | 0 |
| 2.840000000000006 | 0.058 | 0.001 | 0 |
| 2.844000000000006 | 0.057 | 0.001 | 0 |
| 2.848000000000006 | 0.056 | 0.001 | 0 |
| 2.852000000000006 | 0.055 | 0.001 | 0 |
| 2.856000000000006 | 0.054 | 0.001 | 0 |
| 2.860000000000006 | 0.054 | 0.001 | 0 |
| 2.864000000000006 | 0.053 | 0.001 | 0 |
| 2.868000000000006 | 0.052 | 0.001 | 0 |
| 2.872000000000006 | 0.051 | 0.001 | 0 |
| 2.876000000000006 | 0.05 | 0.001 | 0 |
| 2.880000000000006 | 0.05 | 0.001 | 0 |
| 2.884000000000006 | 0.049 | 0.001 | 0 |
| 2.888000000000006 | 0.048 | 0.001 | 0 |
| 2.892000000000006 | 0.047 | 0.001 | 0 |
| 2.896000000000006 | 0.046 | 0.001 | 0 |
| 2.900000000000006 | 0.046 | 0.001 | 0 |
| 2.904000000000006 | 0.045 | 0.001 | 0 |
| 2.908000000000006 | 0.044 | 0.001 | 0 |
| 2.912000000000006 | 0.043 | 0.001 | 0 |
| 2.916000000000006 | 0.043 | 0.001 | 0 |
| 2.920000000000006 | 0.042 | 0.001 | 0 |
| 2.924000000000006 | 0.041 | 0.001 | 0 |
| 2.928000000000006 | 0.041 | 0.001 | 0 |
| 2.932000000000006 | 0.04 | 0.001 | 0 |
| 2.936000000000006 | 0.039 | 0.001 | 0 |
| 2.940000000000006 | 0.039 | 0.001 | 0 |
| 2.944000000000006 | 0.038 | 0 | 0 |
| 2.948000000000006 | 0.037 | 0 | 0 |
| 2.952000000000006 | 0.037 | 0 | 0 |
| 2.956000000000006 | 0.036 | 0 | 0 |
| 2.960000000000006 | 0.036 | 0 | 0 |
| 2.964000000000006 | 0.035 | 0 | 0 |
| 2.968000000000006 | 0.034 | 0 | 0 |
| 2.972000000000006 | 0.034 | 0 | 0 |
| 2.976000000000006 | 0.033 | 0 | 0 |
| 2.980000000000006 | 0.033 | 0 | 0 |
| 2.984000000000006 | 0.032 | 0 | 0 |
| 2.988000000000006 | 0.032 | 0 | 0 |
| 2.992000000000006 | 0.031 | 0 | 0 |
| 2.996000000000006 | 0.031 | 0 | 0 |
| 3.000000000000006 | 0.03 | 0 | 0 |
| 3.004000000000006 | 0.029 | 0 | 0 |
| 3.008000000000006 | 0.029 | 0 | 0 |
| 3.012000000000006 | 0.028 | 0 | 0 |
| 3.016000000000006 | 0.028 | 0 | 0 |
| 3.020000000000006 | 0.027 | 0 | 0 |
| 3.024000000000006 | 0.027 | 0 | 0 |
| 3.028000000000006 | 0.027 | 0 | 0 |
| 3.032000000000006 | 0.026 | 0 | 0 |
| 3.036000000000006 | 0.026 | 0 | 0 |
| 3.040000000000006 | 0.025 | 0 | 0 |
| 3.044000000000006 | 0.025 | 0 | 0 |
| 3.048000000000006 | 0.024 | 0 | 0 |
| 3.052000000000006 | 0.024 | 0 | 0 |
| 3.056000000000006 | 0.023 | 0 | 0 |
| 3.060000000000006 | 0.023 | 0 | 0 |
| 3.064000000000006 | 0.023 | 0 | 0 |
| 3.068000000000006 | 0.022 | 0 | 0 |
| 3.072000000000006 | 0.022 | 0 | 0 |
| 3.076000000000006 | 0.021 | 0 | 0 |
| 3.080000000000006 | 0.021 | 0 | 0 |
| 3.084000000000006 | 0.021 | 0 | 0 |
| 3.088000000000006 | 0.02 | 0 | 0 |
| 3.092000000000006 | 0.02 | 0 | 0 |
| 3.096000000000006 | 0.02 | 0 | 0 |
| 3.100000000000006 | 0.019 | 0 | 0 |
| 3.104000000000006 | 0.019 | 0 | 0 |
| 3.108000000000006 | 0.019 | 0 | 0 |
| 3.112000000000006 | 0.018 | 0 | 0 |
| 3.116000000000006 | 0.018 | 0 | 0 |
| 3.120000000000006 | 0.018 | 0 | 0 |
| 3.124000000000006 | 0.017 | 0 | 0 |
| 3.128000000000006 | 0.017 | 0 | 0 |
| 3.132000000000006 | 0.017 | 0 | 0 |
| 3.136000000000006 | 0.016 | 0 | 0 |
| 3.140000000000006 | 0.016 | 0 | 0 |
| 3.144000000000006 | 0.016 | 0 | 0 |
| 3.148000000000006 | 0.015 | 0 | 0 |
| 3.152000000000006 | 0.015 | 0 | 0 |
| 3.156000000000006 | 0.015 | 0 | 0 |
| 3.160000000000006 | 0.015 | 0 | 0 |
| 3.164000000000006 | 0.014 | 0 | 0 |
| 3.168000000000006 | 0.014 | 0 | 0 |
| 3.172000000000006 | 0.014 | 0 | 0 |
| 3.176000000000006 | 0.013 | 0 | 0 |
| 3.180000000000006 | 0.013 | 0 | 0 |
| 3.184000000000006 | 0.013 | 0 | 0 |
| 3.188000000000006 | 0.013 | 0 | 0 |
| 3.192000000000006 | 0.012 | 0 | 0 |
| 3.196000000000006 | 0.012 | 0 | 0 |
| 3.200000000000006 | 0.012 | 0 | 0 |
| 3.204000000000006 | 0.012 | 0 | 0 |
| 3.208000000000006 | 0.012 | 0 | 0 |
| 3.212000000000006 | 0.011 | 0 | 0 |
| 3.216000000000006 | 0.011 | 0 | 0 |
| 3.220000000000006 | 0.011 | 0 | 0 |
| 3.224000000000006 | 0.011 | 0 | 0 |
| 3.228000000000006 | 0.01 | 0 | 0 |
| 3.232000000000006 | 0.01 | 0 | 0 |
| 3.236000000000006 | 0.01 | 0 | 0 |
| 3.240000000000006 | 0.01 | 0 | 0 |
| 3.244000000000006 | 0.01 | 0 | 0 |
| 3.248000000000006 | 0.009 | 0 | 0 |
| 3.252000000000006 | 0.009 | 0 | 0 |
| 3.256000000000006 | 0.009 | 0 | 0 |
| 3.260000000000006 | 0.009 | 0 | 0 |
| 3.264000000000006 | 0.009 | 0 | 0 |
| 3.268000000000006 | 0.009 | 0 | 0 |
| 3.272000000000006 | 0.008 | 0 | 0 |
| 3.276000000000006 | 0.008 | 0 | 0 |
| 3.280000000000006 | 0.008 | 0 | 0 |
| 3.284000000000006 | 0.008 | 0 | 0 |
| 3.288000000000006 | 0.008 | 0 | 0 |
| 3.292000000000006 | 0.008 | 0 | 0 |
| 3.296000000000006 | 0.007 | 0 | 0 |
| 3.300000000000006 | 0.007 | 0 | 0 |
| 3.304000000000006 | 0.007 | 0 | 0 |
| 3.308000000000006 | 0.007 | 0 | 0 |
| 3.312000000000006 | 0.007 | 0 | 0 |
| 3.316000000000006 | 0.007 | 0 | 0 |
| 3.320000000000006 | 0.007 | 0 | 0 |
| 3.324000000000006 | 0.006 | 0 | 0 |
| 3.328000000000006 | 0.006 | 0 | 0 |
| 3.332000000000006 | 0.006 | 0 | 0 |
| 3.336000000000006 | 0.006 | 0 | 0 |
| 3.340000000000006 | 0.006 | 0 | 0 |
| 3.344000000000006 | 0.006 | 0 | 0 |
| 3.348000000000006 | 0.006 | 0 | 0 |
| 3.352000000000006 | 0.006 | 0 | 0 |
| 3.356000000000006 | 0.005 | 0 | 0 |
| 3.360000000000006 | 0.005 | 0 | 0 |
| 3.364000000000006 | 0.005 | 0 | 0 |
| 3.368000000000006 | 0.005 | 0 | 0 |
| 3.372000000000006 | 0.005 | 0 | 0 |
| 3.376000000000006 | 0.005 | 0 | 0 |
| 3.380000000000006 | 0.005 | 0 | 0 |
| 3.384000000000006 | 0.005 | 0 | 0 |
| 3.388000000000006 | 0.005 | 0 | 0 |
| 3.392000000000006 | 0.005 | 0 | 0 |
| 3.396000000000006 | 0.004 | 0 | 0 |
| 3.400000000000006 | 0.004 | 0 | 0 |
| 3.404000000000006 | 0.004 | 0 | 0 |
| 3.408000000000006 | 0.004 | 0 | 0 |
| 3.412000000000006 | 0.004 | 0 | 0 |
| 3.416000000000006 | 0.004 | 0 | 0 |
| 3.420000000000006 | 0.004 | 0 | 0 |
| 3.424000000000006 | 0.004 | 0 | 0 |
| 3.428000000000006 | 0.004 | 0 | 0 |
| 3.432000000000006 | 0.004 | 0 | 0 |
| 3.436000000000006 | 0.004 | 0 | 0 |
| 3.440000000000006 | 0.003 | 0 | 0 |
| 3.444000000000006 | 0.003 | 0 | 0 |
| 3.448000000000006 | 0.003 | 0 | 0 |
| 3.452000000000006 | 0.003 | 0 | 0 |
| 3.456000000000006 | 0.003 | 0 | 0 |
| 3.460000000000006 | 0.003 | 0 | 0 |
| 3.464000000000006 | 0.003 | 0 | 0 |
| 3.468000000000006 | 0.003 | 0 | 0 |
| 3.472000000000006 | 0.003 | 0 | 0 |
| 3.476000000000006 | 0.003 | 0 | 0 |
| 3.480000000000006 | 0.003 | 0 | 0 |
| 3.484000000000006 | 0.003 | 0 | 0 |
| 3.488000000000006 | 0.003 | 0 | 0 |
| 3.492000000000006 | 0.003 | 0 | 0 |
| 3.496000000000006 | 0.003 | 0 | 0 |
| 3.500000000000006 | 0.003 | 0 | 0 |
| 3.504000000000006 | 0.002 | 0 | 0 |
| 3.508000000000006 | 0.002 | 0 | 0 |
| 3.512000000000006 | 0.002 | 0 | 0 |
| 3.516000000000006 | 0.002 | 0 | 0 |
| 3.520000000000006 | 0.002 | 0 | 0 |
| 3.524000000000006 | 0.002 | 0 | 0 |
| 3.528000000000006 | 0.002 | 0 | 0 |
| 3.532000000000006 | 0.002 | 0 | 0 |
| 3.536000000000006 | 0.002 | 0 | 0 |
| 3.540000000000006 | 0.002 | 0 | 0 |
| 3.544000000000006 | 0.002 | 0 | 0 |
| 3.548000000000006 | 0.002 | 0 | 0 |
| 3.552000000000006 | 0.002 | 0 | 0 |
| 3.556000000000006 | 0.002 | 0 | 0 |
| 3.560000000000006 | 0.002 | 0 | 0 |
| 3.564000000000006 | 0.002 | 0 | 0 |
| 3.568000000000006 | 0.002 | 0 | 0 |
| 3.572000000000006 | 0.002 | 0 | 0 |
| 3.576000000000006 | 0.002 | 0 | 0 |
| 3.580000000000006 | 0.002 | 0 | 0 |
| 3.584000000000006 | 0.002 | 0 | 0 |
| 3.588000000000006 | 0.002 | 0 | 0 |
| 3.592000000000006 | 0.001 | 0 | 0 |
| 3.596000000000006 | 0.001 | 0 | 0 |
| 3.600000000000006 | 0.001 | 0 | 0 |
| 3.604000000000006 | 0.001 | 0 | 0 |
| 3.608000000000006 | 0.001 | 0 | 0 |
| 3.612000000000006 | 0.001 | 0 | 0 |
| 3.616000000000006 | 0.001 | 0 | 0 |
| 3.620000000000006 | 0.001 | 0 | 0 |
| 3.624000000000006 | 0.001 | 0 | 0 |
| 3.628000000000006 | 0.001 | 0 | 0 |
| 3.632000000000006 | 0.001 | 0 | 0 |
| 3.636000000000006 | 0.001 | 0 | 0 |
| 3.640000000000006 | 0.001 | 0 | 0 |
| 3.644000000000006 | 0.001 | 0 | 0 |
| 3.648000000000006 | 0.001 | 0 | 0 |
| 3.652000000000006 | 0.001 | 0 | 0 |
| 3.656000000000006 | 0.001 | 0 | 0 |
| 3.660000000000006 | 0.001 | 0 | 0 |
| 3.664000000000006 | 0.001 | 0 | 0 |
| 3.668000000000006 | 0.001 | 0 | 0 |
| 3.672000000000006 | 0.001 | 0 | 0 |
| 3.676000000000006 | 0.001 | 0 | 0 |
| 3.680000000000006 | 0.001 | 0 | 0 |
| 3.684000000000006 | 0.001 | 0 | 0 |
| 3.688000000000006 | 0.001 | 0 | 0 |
| 3.692000000000006 | 0.001 | 0 | 0 |
| 3.696000000000006 | 0.001 | 0 | 0 |
| 3.700000000000006 | 0.001 | 0 | 0 |
| 3.704000000000006 | 0.001 | 0 | 0 |
| 3.708000000000006 | 0.001 | 0 | 0 |
| 3.712000000000006 | 0.001 | 0 | 0 |
| 3.716000000000006 | 0.001 | 0 | 0 |
| 3.720000000000006 | 0.001 | 0 | 0 |
| 3.724000000000006 | 0.001 | 0 | 0 |
| 3.728000000000006 | 0.001 | 0 | 0 |
| 3.732000000000006 | 0.001 | 0 | 0 |
| 3.736000000000006 | 0.001 | 0 | 0 |
| 3.740000000000006 | 0.001 | 0 | 0 |
| 3.744000000000006 | 0.001 | 0 | 0 |
| 3.748000000000006 | 0.001 | 0 | 0 |
| 3.752000000000006 | 0.001 | 0 | 0 |
| 3.756000000000006 | 0.001 | 0 | 0 |
| 3.760000000000006 | 0.001 | 0 | 0 |
| 3.764000000000006 | 0.001 | 0 | 0 |
| 3.768000000000006 | 0.001 | 0 | 0 |
| 3.772000000000006 | 0.001 | 0 | 0 |
| 3.776000000000006 | 0 | 0 | 0 |
| 3.780000000000006 | 0 | 0 | 0 |
| 3.784000000000006 | 0 | 0 | 0 |
| 3.788000000000006 | 0 | 0 | 0 |
| 3.792000000000006 | 0 | 0 | 0 |
| 3.796000000000006 | 0 | 0 | 0 |
| 3.800000000000006 | 0 | 0 | 0 |
| 3.804000000000006 | 0 | 0 | 0 |
| 3.808000000000006 | 0 | 0 | 0 |
| 3.812000000000006 | 0 | 0 | 0 |
| 3.816000000000006 | 0 | 0 | 0 |
| 3.820000000000006 | 0 | 0 | 0 |
| 3.824000000000006 | 0 | 0 | 0 |
| 3.828000000000006 | 0 | 0 | 0 |
| 3.832000000000006 | 0 | 0 | 0 |
| 3.836000000000006 | 0 | 0 | 0 |
| 3.840000000000006 | 0 | 0 | 0 |
| 3.844000000000006 | 0 | 0 | 0 |
| 3.848000000000006 | 0 | 0 | 0 |
| 3.852000000000006 | 0 | 0 | 0 |
| 3.856000000000006 | 0 | 0 | 0 |
| 3.860000000000006 | 0 | 0 | 0 |
| 3.864000000000006 | 0 | 0 | 0 |
| 3.868000000000006 | 0 | 0 | 0 |
| 3.872000000000006 | 0 | 0 | 0 |
| 3.876000000000006 | 0 | 0 | 0 |
| 3.880000000000006 | 0 | 0 | 0 |
| 3.884000000000006 | 0 | 0 | 0 |
| 3.888000000000007 | 0 | 0 | 0 |
| 3.892000000000006 | 0 | 0 | 0 |
| 3.896000000000006 | 0 | 0 | 0 |
| 3.900000000000007 | 0 | 0 | 0 |
| 3.904000000000007 | 0 | 0 | 0 |
| 3.908000000000007 | 0 | 0 | 0 |
| 3.912000000000007 | 0 | 0 | 0 |
| 3.916000000000007 | 0 | 0 | 0 |
| 3.920000000000007 | 0 | 0 | 0 |
| 3.924000000000007 | 0 | 0 | 0 |
| 3.928000000000007 | 0 | 0 | 0 |
| 3.932000000000007 | 0 | 0 | 0 |
| 3.936000000000007 | 0 | 0 | 0 |
| 3.940000000000007 | 0 | 0 | 0 |
| 3.944000000000007 | 0 | 0 | 0 |
| 3.948000000000007 | 0 | 0 | 0 |
| 3.952000000000007 | 0 | 0 | 0 |
| 3.956000000000007 | 0 | 0 | 0 |
| 3.960000000000007 | 0 | 0 | 0 |
| 3.964000000000007 | 0 | 0 | 0 |
| 3.968000000000007 | 0 | 0 | 0 |
| 3.972000000000007 | 0 | 0 | 0 |
| 3.976000000000007 | 0 | 0 | 0 |
| 3.980000000000007 | 0 | 0 | 0 |
| 3.984000000000007 | 0 | 0 | 0 |
| 3.988000000000007 | 0 | 0 | 0 |
| 3.992000000000007 | 0 | 0 | 0 |
| 3.996000000000007 | 0 | 0 | 0 |
| 4.000000000000006 | 0 | 0 | 0 |